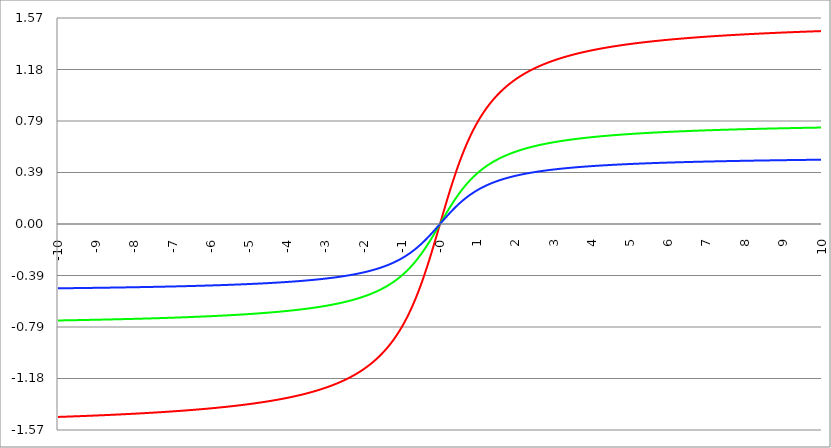
| Category | Series 1 | Series 0 | Series 2 |
|---|---|---|---|
| -10.0 | -1.471 | -0.736 | -0.49 |
| -9.99 | -1.471 | -0.736 | -0.49 |
| -9.98 | -1.471 | -0.735 | -0.49 |
| -9.97 | -1.471 | -0.735 | -0.49 |
| -9.96 | -1.471 | -0.735 | -0.49 |
| -9.95 | -1.471 | -0.735 | -0.49 |
| -9.940000000000001 | -1.471 | -0.735 | -0.49 |
| -9.930000000000001 | -1.47 | -0.735 | -0.49 |
| -9.920000000000002 | -1.47 | -0.735 | -0.49 |
| -9.91 | -1.47 | -0.735 | -0.49 |
| -9.900000000000002 | -1.47 | -0.735 | -0.49 |
| -9.890000000000002 | -1.47 | -0.735 | -0.49 |
| -9.880000000000003 | -1.47 | -0.735 | -0.49 |
| -9.870000000000003 | -1.47 | -0.735 | -0.49 |
| -9.860000000000001 | -1.47 | -0.735 | -0.49 |
| -9.850000000000003 | -1.47 | -0.735 | -0.49 |
| -9.840000000000003 | -1.47 | -0.735 | -0.49 |
| -9.830000000000004 | -1.469 | -0.735 | -0.49 |
| -9.820000000000004 | -1.469 | -0.735 | -0.49 |
| -9.810000000000004 | -1.469 | -0.735 | -0.49 |
| -9.800000000000004 | -1.469 | -0.735 | -0.49 |
| -9.790000000000004 | -1.469 | -0.735 | -0.49 |
| -9.780000000000005 | -1.469 | -0.734 | -0.49 |
| -9.770000000000005 | -1.469 | -0.734 | -0.49 |
| -9.760000000000005 | -1.469 | -0.734 | -0.49 |
| -9.750000000000005 | -1.469 | -0.734 | -0.49 |
| -9.740000000000006 | -1.468 | -0.734 | -0.489 |
| -9.730000000000006 | -1.468 | -0.734 | -0.489 |
| -9.720000000000006 | -1.468 | -0.734 | -0.489 |
| -9.710000000000006 | -1.468 | -0.734 | -0.489 |
| -9.700000000000006 | -1.468 | -0.734 | -0.489 |
| -9.690000000000007 | -1.468 | -0.734 | -0.489 |
| -9.680000000000007 | -1.468 | -0.734 | -0.489 |
| -9.670000000000007 | -1.468 | -0.734 | -0.489 |
| -9.660000000000007 | -1.468 | -0.734 | -0.489 |
| -9.650000000000007 | -1.468 | -0.734 | -0.489 |
| -9.640000000000008 | -1.467 | -0.734 | -0.489 |
| -9.630000000000008 | -1.467 | -0.734 | -0.489 |
| -9.620000000000008 | -1.467 | -0.734 | -0.489 |
| -9.610000000000008 | -1.467 | -0.734 | -0.489 |
| -9.600000000000009 | -1.467 | -0.734 | -0.489 |
| -9.590000000000009 | -1.467 | -0.733 | -0.489 |
| -9.580000000000007 | -1.467 | -0.733 | -0.489 |
| -9.57000000000001 | -1.467 | -0.733 | -0.489 |
| -9.56000000000001 | -1.467 | -0.733 | -0.489 |
| -9.55000000000001 | -1.466 | -0.733 | -0.489 |
| -9.54000000000001 | -1.466 | -0.733 | -0.489 |
| -9.53000000000001 | -1.466 | -0.733 | -0.489 |
| -9.52000000000001 | -1.466 | -0.733 | -0.489 |
| -9.51000000000001 | -1.466 | -0.733 | -0.489 |
| -9.50000000000001 | -1.466 | -0.733 | -0.489 |
| -9.49000000000001 | -1.466 | -0.733 | -0.489 |
| -9.48000000000001 | -1.466 | -0.733 | -0.489 |
| -9.47000000000001 | -1.466 | -0.733 | -0.489 |
| -9.46000000000001 | -1.465 | -0.733 | -0.488 |
| -9.45000000000001 | -1.465 | -0.733 | -0.488 |
| -9.44000000000001 | -1.465 | -0.733 | -0.488 |
| -9.430000000000012 | -1.465 | -0.733 | -0.488 |
| -9.420000000000012 | -1.465 | -0.733 | -0.488 |
| -9.410000000000013 | -1.465 | -0.732 | -0.488 |
| -9.400000000000013 | -1.465 | -0.732 | -0.488 |
| -9.390000000000011 | -1.465 | -0.732 | -0.488 |
| -9.380000000000013 | -1.465 | -0.732 | -0.488 |
| -9.370000000000013 | -1.464 | -0.732 | -0.488 |
| -9.360000000000014 | -1.464 | -0.732 | -0.488 |
| -9.350000000000014 | -1.464 | -0.732 | -0.488 |
| -9.340000000000014 | -1.464 | -0.732 | -0.488 |
| -9.330000000000014 | -1.464 | -0.732 | -0.488 |
| -9.320000000000014 | -1.464 | -0.732 | -0.488 |
| -9.310000000000015 | -1.464 | -0.732 | -0.488 |
| -9.300000000000013 | -1.464 | -0.732 | -0.488 |
| -9.290000000000015 | -1.464 | -0.732 | -0.488 |
| -9.280000000000015 | -1.463 | -0.732 | -0.488 |
| -9.270000000000016 | -1.463 | -0.732 | -0.488 |
| -9.260000000000016 | -1.463 | -0.732 | -0.488 |
| -9.250000000000014 | -1.463 | -0.732 | -0.488 |
| -9.240000000000016 | -1.463 | -0.731 | -0.488 |
| -9.230000000000016 | -1.463 | -0.731 | -0.488 |
| -9.220000000000017 | -1.463 | -0.731 | -0.488 |
| -9.210000000000017 | -1.463 | -0.731 | -0.488 |
| -9.200000000000017 | -1.463 | -0.731 | -0.488 |
| -9.190000000000017 | -1.462 | -0.731 | -0.487 |
| -9.180000000000017 | -1.462 | -0.731 | -0.487 |
| -9.170000000000018 | -1.462 | -0.731 | -0.487 |
| -9.160000000000016 | -1.462 | -0.731 | -0.487 |
| -9.150000000000018 | -1.462 | -0.731 | -0.487 |
| -9.140000000000018 | -1.462 | -0.731 | -0.487 |
| -9.130000000000019 | -1.462 | -0.731 | -0.487 |
| -9.120000000000019 | -1.462 | -0.731 | -0.487 |
| -9.110000000000017 | -1.461 | -0.731 | -0.487 |
| -9.10000000000002 | -1.461 | -0.731 | -0.487 |
| -9.09000000000002 | -1.461 | -0.731 | -0.487 |
| -9.08000000000002 | -1.461 | -0.731 | -0.487 |
| -9.07000000000002 | -1.461 | -0.73 | -0.487 |
| -9.06000000000002 | -1.461 | -0.73 | -0.487 |
| -9.05000000000002 | -1.461 | -0.73 | -0.487 |
| -9.04000000000002 | -1.461 | -0.73 | -0.487 |
| -9.03000000000002 | -1.461 | -0.73 | -0.487 |
| -9.020000000000021 | -1.46 | -0.73 | -0.487 |
| -9.010000000000021 | -1.46 | -0.73 | -0.487 |
| -9.000000000000021 | -1.46 | -0.73 | -0.487 |
| -8.990000000000022 | -1.46 | -0.73 | -0.487 |
| -8.980000000000022 | -1.46 | -0.73 | -0.487 |
| -8.97000000000002 | -1.46 | -0.73 | -0.487 |
| -8.960000000000022 | -1.46 | -0.73 | -0.487 |
| -8.950000000000022 | -1.46 | -0.73 | -0.487 |
| -8.940000000000023 | -1.459 | -0.73 | -0.486 |
| -8.930000000000023 | -1.459 | -0.73 | -0.486 |
| -8.920000000000023 | -1.459 | -0.73 | -0.486 |
| -8.910000000000023 | -1.459 | -0.73 | -0.486 |
| -8.900000000000023 | -1.459 | -0.729 | -0.486 |
| -8.890000000000024 | -1.459 | -0.729 | -0.486 |
| -8.880000000000024 | -1.459 | -0.729 | -0.486 |
| -8.870000000000024 | -1.459 | -0.729 | -0.486 |
| -8.860000000000024 | -1.458 | -0.729 | -0.486 |
| -8.850000000000025 | -1.458 | -0.729 | -0.486 |
| -8.840000000000025 | -1.458 | -0.729 | -0.486 |
| -8.830000000000025 | -1.458 | -0.729 | -0.486 |
| -8.820000000000025 | -1.458 | -0.729 | -0.486 |
| -8.810000000000025 | -1.458 | -0.729 | -0.486 |
| -8.800000000000026 | -1.458 | -0.729 | -0.486 |
| -8.790000000000026 | -1.458 | -0.729 | -0.486 |
| -8.780000000000026 | -1.457 | -0.729 | -0.486 |
| -8.770000000000026 | -1.457 | -0.729 | -0.486 |
| -8.760000000000026 | -1.457 | -0.729 | -0.486 |
| -8.750000000000027 | -1.457 | -0.729 | -0.486 |
| -8.740000000000027 | -1.457 | -0.728 | -0.486 |
| -8.730000000000027 | -1.457 | -0.728 | -0.486 |
| -8.720000000000027 | -1.457 | -0.728 | -0.486 |
| -8.710000000000027 | -1.456 | -0.728 | -0.485 |
| -8.700000000000028 | -1.456 | -0.728 | -0.485 |
| -8.690000000000028 | -1.456 | -0.728 | -0.485 |
| -8.680000000000028 | -1.456 | -0.728 | -0.485 |
| -8.670000000000028 | -1.456 | -0.728 | -0.485 |
| -8.660000000000029 | -1.456 | -0.728 | -0.485 |
| -8.650000000000029 | -1.456 | -0.728 | -0.485 |
| -8.640000000000029 | -1.456 | -0.728 | -0.485 |
| -8.63000000000003 | -1.455 | -0.728 | -0.485 |
| -8.62000000000003 | -1.455 | -0.728 | -0.485 |
| -8.61000000000003 | -1.455 | -0.728 | -0.485 |
| -8.60000000000003 | -1.455 | -0.728 | -0.485 |
| -8.59000000000003 | -1.455 | -0.727 | -0.485 |
| -8.58000000000003 | -1.455 | -0.727 | -0.485 |
| -8.57000000000003 | -1.455 | -0.727 | -0.485 |
| -8.56000000000003 | -1.455 | -0.727 | -0.485 |
| -8.55000000000003 | -1.454 | -0.727 | -0.485 |
| -8.540000000000031 | -1.454 | -0.727 | -0.485 |
| -8.530000000000031 | -1.454 | -0.727 | -0.485 |
| -8.520000000000032 | -1.454 | -0.727 | -0.485 |
| -8.510000000000032 | -1.454 | -0.727 | -0.485 |
| -8.50000000000003 | -1.454 | -0.727 | -0.485 |
| -8.490000000000032 | -1.454 | -0.727 | -0.485 |
| -8.480000000000032 | -1.453 | -0.727 | -0.484 |
| -8.470000000000033 | -1.453 | -0.727 | -0.484 |
| -8.460000000000033 | -1.453 | -0.727 | -0.484 |
| -8.450000000000033 | -1.453 | -0.727 | -0.484 |
| -8.440000000000033 | -1.453 | -0.726 | -0.484 |
| -8.430000000000033 | -1.453 | -0.726 | -0.484 |
| -8.420000000000034 | -1.453 | -0.726 | -0.484 |
| -8.410000000000032 | -1.452 | -0.726 | -0.484 |
| -8.400000000000034 | -1.452 | -0.726 | -0.484 |
| -8.390000000000034 | -1.452 | -0.726 | -0.484 |
| -8.380000000000035 | -1.452 | -0.726 | -0.484 |
| -8.370000000000035 | -1.452 | -0.726 | -0.484 |
| -8.360000000000033 | -1.452 | -0.726 | -0.484 |
| -8.350000000000035 | -1.452 | -0.726 | -0.484 |
| -8.340000000000035 | -1.451 | -0.726 | -0.484 |
| -8.330000000000036 | -1.451 | -0.726 | -0.484 |
| -8.320000000000036 | -1.451 | -0.726 | -0.484 |
| -8.310000000000034 | -1.451 | -0.726 | -0.484 |
| -8.300000000000036 | -1.451 | -0.725 | -0.484 |
| -8.290000000000036 | -1.451 | -0.725 | -0.484 |
| -8.280000000000037 | -1.451 | -0.725 | -0.484 |
| -8.270000000000037 | -1.45 | -0.725 | -0.483 |
| -8.260000000000037 | -1.45 | -0.725 | -0.483 |
| -8.250000000000037 | -1.45 | -0.725 | -0.483 |
| -8.240000000000038 | -1.45 | -0.725 | -0.483 |
| -8.230000000000038 | -1.45 | -0.725 | -0.483 |
| -8.220000000000038 | -1.45 | -0.725 | -0.483 |
| -8.210000000000038 | -1.45 | -0.725 | -0.483 |
| -8.200000000000038 | -1.449 | -0.725 | -0.483 |
| -8.190000000000039 | -1.449 | -0.725 | -0.483 |
| -8.180000000000039 | -1.449 | -0.725 | -0.483 |
| -8.170000000000037 | -1.449 | -0.725 | -0.483 |
| -8.16000000000004 | -1.449 | -0.724 | -0.483 |
| -8.15000000000004 | -1.449 | -0.724 | -0.483 |
| -8.14000000000004 | -1.449 | -0.724 | -0.483 |
| -8.13000000000004 | -1.448 | -0.724 | -0.483 |
| -8.12000000000004 | -1.448 | -0.724 | -0.483 |
| -8.11000000000004 | -1.448 | -0.724 | -0.483 |
| -8.10000000000004 | -1.448 | -0.724 | -0.483 |
| -8.09000000000004 | -1.448 | -0.724 | -0.483 |
| -8.08000000000004 | -1.448 | -0.724 | -0.483 |
| -8.07000000000004 | -1.448 | -0.724 | -0.483 |
| -8.06000000000004 | -1.447 | -0.724 | -0.482 |
| -8.05000000000004 | -1.447 | -0.724 | -0.482 |
| -8.040000000000042 | -1.447 | -0.724 | -0.482 |
| -8.03000000000004 | -1.447 | -0.723 | -0.482 |
| -8.020000000000042 | -1.447 | -0.723 | -0.482 |
| -8.010000000000042 | -1.447 | -0.723 | -0.482 |
| -8.000000000000043 | -1.446 | -0.723 | -0.482 |
| -7.990000000000043 | -1.446 | -0.723 | -0.482 |
| -7.980000000000043 | -1.446 | -0.723 | -0.482 |
| -7.970000000000043 | -1.446 | -0.723 | -0.482 |
| -7.960000000000043 | -1.446 | -0.723 | -0.482 |
| -7.950000000000044 | -1.446 | -0.723 | -0.482 |
| -7.940000000000044 | -1.446 | -0.723 | -0.482 |
| -7.930000000000044 | -1.445 | -0.723 | -0.482 |
| -7.920000000000044 | -1.445 | -0.723 | -0.482 |
| -7.910000000000044 | -1.445 | -0.723 | -0.482 |
| -7.900000000000044 | -1.445 | -0.722 | -0.482 |
| -7.890000000000045 | -1.445 | -0.722 | -0.482 |
| -7.880000000000045 | -1.445 | -0.722 | -0.482 |
| -7.870000000000045 | -1.444 | -0.722 | -0.481 |
| -7.860000000000046 | -1.444 | -0.722 | -0.481 |
| -7.850000000000046 | -1.444 | -0.722 | -0.481 |
| -7.840000000000046 | -1.444 | -0.722 | -0.481 |
| -7.830000000000046 | -1.444 | -0.722 | -0.481 |
| -7.820000000000046 | -1.444 | -0.722 | -0.481 |
| -7.810000000000047 | -1.443 | -0.722 | -0.481 |
| -7.800000000000047 | -1.443 | -0.722 | -0.481 |
| -7.790000000000047 | -1.443 | -0.722 | -0.481 |
| -7.780000000000047 | -1.443 | -0.721 | -0.481 |
| -7.770000000000047 | -1.443 | -0.721 | -0.481 |
| -7.760000000000048 | -1.443 | -0.721 | -0.481 |
| -7.750000000000048 | -1.442 | -0.721 | -0.481 |
| -7.740000000000048 | -1.442 | -0.721 | -0.481 |
| -7.730000000000048 | -1.442 | -0.721 | -0.481 |
| -7.720000000000049 | -1.442 | -0.721 | -0.481 |
| -7.710000000000049 | -1.442 | -0.721 | -0.481 |
| -7.700000000000049 | -1.442 | -0.721 | -0.481 |
| -7.690000000000049 | -1.441 | -0.721 | -0.48 |
| -7.680000000000049 | -1.441 | -0.721 | -0.48 |
| -7.67000000000005 | -1.441 | -0.721 | -0.48 |
| -7.66000000000005 | -1.441 | -0.72 | -0.48 |
| -7.65000000000005 | -1.441 | -0.72 | -0.48 |
| -7.64000000000005 | -1.441 | -0.72 | -0.48 |
| -7.63000000000005 | -1.44 | -0.72 | -0.48 |
| -7.620000000000051 | -1.44 | -0.72 | -0.48 |
| -7.610000000000051 | -1.44 | -0.72 | -0.48 |
| -7.600000000000051 | -1.44 | -0.72 | -0.48 |
| -7.590000000000051 | -1.44 | -0.72 | -0.48 |
| -7.580000000000052 | -1.44 | -0.72 | -0.48 |
| -7.570000000000052 | -1.439 | -0.72 | -0.48 |
| -7.560000000000052 | -1.439 | -0.72 | -0.48 |
| -7.550000000000052 | -1.439 | -0.72 | -0.48 |
| -7.540000000000052 | -1.439 | -0.719 | -0.48 |
| -7.530000000000053 | -1.439 | -0.719 | -0.48 |
| -7.520000000000053 | -1.439 | -0.719 | -0.48 |
| -7.510000000000053 | -1.438 | -0.719 | -0.479 |
| -7.500000000000053 | -1.438 | -0.719 | -0.479 |
| -7.490000000000053 | -1.438 | -0.719 | -0.479 |
| -7.480000000000054 | -1.438 | -0.719 | -0.479 |
| -7.470000000000054 | -1.438 | -0.719 | -0.479 |
| -7.460000000000054 | -1.438 | -0.719 | -0.479 |
| -7.450000000000054 | -1.437 | -0.719 | -0.479 |
| -7.440000000000054 | -1.437 | -0.719 | -0.479 |
| -7.430000000000054 | -1.437 | -0.719 | -0.479 |
| -7.420000000000055 | -1.437 | -0.718 | -0.479 |
| -7.410000000000055 | -1.437 | -0.718 | -0.479 |
| -7.400000000000055 | -1.436 | -0.718 | -0.479 |
| -7.390000000000056 | -1.436 | -0.718 | -0.479 |
| -7.380000000000056 | -1.436 | -0.718 | -0.479 |
| -7.370000000000056 | -1.436 | -0.718 | -0.479 |
| -7.360000000000056 | -1.436 | -0.718 | -0.479 |
| -7.350000000000056 | -1.436 | -0.718 | -0.479 |
| -7.340000000000057 | -1.435 | -0.718 | -0.478 |
| -7.330000000000057 | -1.435 | -0.718 | -0.478 |
| -7.320000000000057 | -1.435 | -0.718 | -0.478 |
| -7.310000000000057 | -1.435 | -0.717 | -0.478 |
| -7.300000000000058 | -1.435 | -0.717 | -0.478 |
| -7.290000000000058 | -1.434 | -0.717 | -0.478 |
| -7.280000000000058 | -1.434 | -0.717 | -0.478 |
| -7.270000000000058 | -1.434 | -0.717 | -0.478 |
| -7.260000000000058 | -1.434 | -0.717 | -0.478 |
| -7.250000000000059 | -1.434 | -0.717 | -0.478 |
| -7.240000000000059 | -1.434 | -0.717 | -0.478 |
| -7.23000000000006 | -1.433 | -0.717 | -0.478 |
| -7.220000000000059 | -1.433 | -0.717 | -0.478 |
| -7.210000000000059 | -1.433 | -0.716 | -0.478 |
| -7.20000000000006 | -1.433 | -0.716 | -0.478 |
| -7.19000000000006 | -1.433 | -0.716 | -0.478 |
| -7.18000000000006 | -1.432 | -0.716 | -0.477 |
| -7.17000000000006 | -1.432 | -0.716 | -0.477 |
| -7.160000000000061 | -1.432 | -0.716 | -0.477 |
| -7.150000000000061 | -1.432 | -0.716 | -0.477 |
| -7.140000000000061 | -1.432 | -0.716 | -0.477 |
| -7.130000000000061 | -1.431 | -0.716 | -0.477 |
| -7.120000000000061 | -1.431 | -0.716 | -0.477 |
| -7.110000000000062 | -1.431 | -0.716 | -0.477 |
| -7.100000000000062 | -1.431 | -0.715 | -0.477 |
| -7.090000000000062 | -1.431 | -0.715 | -0.477 |
| -7.080000000000062 | -1.43 | -0.715 | -0.477 |
| -7.070000000000062 | -1.43 | -0.715 | -0.477 |
| -7.060000000000063 | -1.43 | -0.715 | -0.477 |
| -7.050000000000063 | -1.43 | -0.715 | -0.477 |
| -7.040000000000063 | -1.43 | -0.715 | -0.477 |
| -7.030000000000063 | -1.429 | -0.715 | -0.476 |
| -7.020000000000064 | -1.429 | -0.715 | -0.476 |
| -7.010000000000064 | -1.429 | -0.715 | -0.476 |
| -7.000000000000064 | -1.429 | -0.714 | -0.476 |
| -6.990000000000064 | -1.429 | -0.714 | -0.476 |
| -6.980000000000064 | -1.428 | -0.714 | -0.476 |
| -6.970000000000064 | -1.428 | -0.714 | -0.476 |
| -6.960000000000064 | -1.428 | -0.714 | -0.476 |
| -6.950000000000064 | -1.428 | -0.714 | -0.476 |
| -6.940000000000065 | -1.428 | -0.714 | -0.476 |
| -6.930000000000065 | -1.427 | -0.714 | -0.476 |
| -6.920000000000065 | -1.427 | -0.714 | -0.476 |
| -6.910000000000065 | -1.427 | -0.714 | -0.476 |
| -6.900000000000066 | -1.427 | -0.713 | -0.476 |
| -6.890000000000066 | -1.427 | -0.713 | -0.476 |
| -6.880000000000066 | -1.426 | -0.713 | -0.475 |
| -6.870000000000066 | -1.426 | -0.713 | -0.475 |
| -6.860000000000067 | -1.426 | -0.713 | -0.475 |
| -6.850000000000067 | -1.426 | -0.713 | -0.475 |
| -6.840000000000067 | -1.426 | -0.713 | -0.475 |
| -6.830000000000067 | -1.425 | -0.713 | -0.475 |
| -6.820000000000068 | -1.425 | -0.713 | -0.475 |
| -6.810000000000068 | -1.425 | -0.712 | -0.475 |
| -6.800000000000068 | -1.425 | -0.712 | -0.475 |
| -6.790000000000068 | -1.425 | -0.712 | -0.475 |
| -6.780000000000068 | -1.424 | -0.712 | -0.475 |
| -6.770000000000068 | -1.424 | -0.712 | -0.475 |
| -6.760000000000069 | -1.424 | -0.712 | -0.475 |
| -6.75000000000007 | -1.424 | -0.712 | -0.475 |
| -6.74000000000007 | -1.424 | -0.712 | -0.475 |
| -6.73000000000007 | -1.423 | -0.712 | -0.474 |
| -6.72000000000007 | -1.423 | -0.712 | -0.474 |
| -6.71000000000007 | -1.423 | -0.711 | -0.474 |
| -6.70000000000007 | -1.423 | -0.711 | -0.474 |
| -6.69000000000007 | -1.422 | -0.711 | -0.474 |
| -6.680000000000071 | -1.422 | -0.711 | -0.474 |
| -6.670000000000071 | -1.422 | -0.711 | -0.474 |
| -6.660000000000071 | -1.422 | -0.711 | -0.474 |
| -6.650000000000071 | -1.422 | -0.711 | -0.474 |
| -6.640000000000072 | -1.421 | -0.711 | -0.474 |
| -6.630000000000072 | -1.421 | -0.711 | -0.474 |
| -6.620000000000072 | -1.421 | -0.71 | -0.474 |
| -6.610000000000072 | -1.421 | -0.71 | -0.474 |
| -6.600000000000072 | -1.42 | -0.71 | -0.473 |
| -6.590000000000073 | -1.42 | -0.71 | -0.473 |
| -6.580000000000073 | -1.42 | -0.71 | -0.473 |
| -6.570000000000073 | -1.42 | -0.71 | -0.473 |
| -6.560000000000073 | -1.42 | -0.71 | -0.473 |
| -6.550000000000074 | -1.419 | -0.71 | -0.473 |
| -6.540000000000074 | -1.419 | -0.71 | -0.473 |
| -6.530000000000074 | -1.419 | -0.709 | -0.473 |
| -6.520000000000074 | -1.419 | -0.709 | -0.473 |
| -6.510000000000074 | -1.418 | -0.709 | -0.473 |
| -6.500000000000074 | -1.418 | -0.709 | -0.473 |
| -6.490000000000074 | -1.418 | -0.709 | -0.473 |
| -6.480000000000074 | -1.418 | -0.709 | -0.473 |
| -6.470000000000075 | -1.417 | -0.709 | -0.472 |
| -6.460000000000075 | -1.417 | -0.709 | -0.472 |
| -6.450000000000075 | -1.417 | -0.708 | -0.472 |
| -6.440000000000075 | -1.417 | -0.708 | -0.472 |
| -6.430000000000076 | -1.417 | -0.708 | -0.472 |
| -6.420000000000076 | -1.416 | -0.708 | -0.472 |
| -6.410000000000076 | -1.416 | -0.708 | -0.472 |
| -6.400000000000076 | -1.416 | -0.708 | -0.472 |
| -6.390000000000077 | -1.416 | -0.708 | -0.472 |
| -6.380000000000077 | -1.415 | -0.708 | -0.472 |
| -6.370000000000077 | -1.415 | -0.708 | -0.472 |
| -6.360000000000078 | -1.415 | -0.707 | -0.472 |
| -6.350000000000078 | -1.415 | -0.707 | -0.472 |
| -6.340000000000078 | -1.414 | -0.707 | -0.471 |
| -6.330000000000078 | -1.414 | -0.707 | -0.471 |
| -6.320000000000078 | -1.414 | -0.707 | -0.471 |
| -6.310000000000079 | -1.414 | -0.707 | -0.471 |
| -6.300000000000079 | -1.413 | -0.707 | -0.471 |
| -6.29000000000008 | -1.413 | -0.707 | -0.471 |
| -6.28000000000008 | -1.413 | -0.706 | -0.471 |
| -6.27000000000008 | -1.413 | -0.706 | -0.471 |
| -6.26000000000008 | -1.412 | -0.706 | -0.471 |
| -6.25000000000008 | -1.412 | -0.706 | -0.471 |
| -6.24000000000008 | -1.412 | -0.706 | -0.471 |
| -6.23000000000008 | -1.412 | -0.706 | -0.471 |
| -6.220000000000081 | -1.411 | -0.706 | -0.47 |
| -6.210000000000081 | -1.411 | -0.706 | -0.47 |
| -6.200000000000081 | -1.411 | -0.705 | -0.47 |
| -6.190000000000081 | -1.411 | -0.705 | -0.47 |
| -6.180000000000081 | -1.41 | -0.705 | -0.47 |
| -6.170000000000082 | -1.41 | -0.705 | -0.47 |
| -6.160000000000082 | -1.41 | -0.705 | -0.47 |
| -6.150000000000082 | -1.41 | -0.705 | -0.47 |
| -6.140000000000082 | -1.409 | -0.705 | -0.47 |
| -6.130000000000082 | -1.409 | -0.705 | -0.47 |
| -6.120000000000083 | -1.409 | -0.704 | -0.47 |
| -6.110000000000083 | -1.409 | -0.704 | -0.47 |
| -6.100000000000083 | -1.408 | -0.704 | -0.469 |
| -6.090000000000083 | -1.408 | -0.704 | -0.469 |
| -6.080000000000084 | -1.408 | -0.704 | -0.469 |
| -6.070000000000084 | -1.408 | -0.704 | -0.469 |
| -6.060000000000084 | -1.407 | -0.704 | -0.469 |
| -6.050000000000084 | -1.407 | -0.703 | -0.469 |
| -6.040000000000084 | -1.407 | -0.703 | -0.469 |
| -6.030000000000084 | -1.406 | -0.703 | -0.469 |
| -6.020000000000085 | -1.406 | -0.703 | -0.469 |
| -6.010000000000085 | -1.406 | -0.703 | -0.469 |
| -6.000000000000085 | -1.406 | -0.703 | -0.469 |
| -5.990000000000085 | -1.405 | -0.703 | -0.468 |
| -5.980000000000085 | -1.405 | -0.703 | -0.468 |
| -5.970000000000085 | -1.405 | -0.702 | -0.468 |
| -5.960000000000086 | -1.405 | -0.702 | -0.468 |
| -5.950000000000086 | -1.404 | -0.702 | -0.468 |
| -5.940000000000086 | -1.404 | -0.702 | -0.468 |
| -5.930000000000086 | -1.404 | -0.702 | -0.468 |
| -5.920000000000087 | -1.403 | -0.702 | -0.468 |
| -5.910000000000087 | -1.403 | -0.702 | -0.468 |
| -5.900000000000087 | -1.403 | -0.701 | -0.468 |
| -5.890000000000088 | -1.403 | -0.701 | -0.468 |
| -5.880000000000088 | -1.402 | -0.701 | -0.467 |
| -5.870000000000088 | -1.402 | -0.701 | -0.467 |
| -5.860000000000088 | -1.402 | -0.701 | -0.467 |
| -5.850000000000088 | -1.401 | -0.701 | -0.467 |
| -5.840000000000089 | -1.401 | -0.701 | -0.467 |
| -5.830000000000089 | -1.401 | -0.7 | -0.467 |
| -5.820000000000089 | -1.401 | -0.7 | -0.467 |
| -5.810000000000089 | -1.4 | -0.7 | -0.467 |
| -5.800000000000089 | -1.4 | -0.7 | -0.467 |
| -5.79000000000009 | -1.4 | -0.7 | -0.467 |
| -5.78000000000009 | -1.399 | -0.7 | -0.466 |
| -5.77000000000009 | -1.399 | -0.7 | -0.466 |
| -5.76000000000009 | -1.399 | -0.699 | -0.466 |
| -5.750000000000091 | -1.399 | -0.699 | -0.466 |
| -5.740000000000091 | -1.398 | -0.699 | -0.466 |
| -5.730000000000091 | -1.398 | -0.699 | -0.466 |
| -5.720000000000091 | -1.398 | -0.699 | -0.466 |
| -5.710000000000091 | -1.397 | -0.699 | -0.466 |
| -5.700000000000092 | -1.397 | -0.699 | -0.466 |
| -5.690000000000092 | -1.397 | -0.698 | -0.466 |
| -5.680000000000092 | -1.397 | -0.698 | -0.466 |
| -5.670000000000092 | -1.396 | -0.698 | -0.465 |
| -5.660000000000092 | -1.396 | -0.698 | -0.465 |
| -5.650000000000093 | -1.396 | -0.698 | -0.465 |
| -5.640000000000093 | -1.395 | -0.698 | -0.465 |
| -5.630000000000093 | -1.395 | -0.698 | -0.465 |
| -5.620000000000093 | -1.395 | -0.697 | -0.465 |
| -5.610000000000093 | -1.394 | -0.697 | -0.465 |
| -5.600000000000094 | -1.394 | -0.697 | -0.465 |
| -5.590000000000094 | -1.394 | -0.697 | -0.465 |
| -5.580000000000094 | -1.393 | -0.697 | -0.464 |
| -5.570000000000094 | -1.393 | -0.697 | -0.464 |
| -5.560000000000095 | -1.393 | -0.696 | -0.464 |
| -5.550000000000095 | -1.393 | -0.696 | -0.464 |
| -5.540000000000095 | -1.392 | -0.696 | -0.464 |
| -5.530000000000095 | -1.392 | -0.696 | -0.464 |
| -5.520000000000095 | -1.392 | -0.696 | -0.464 |
| -5.510000000000096 | -1.391 | -0.696 | -0.464 |
| -5.500000000000096 | -1.391 | -0.695 | -0.464 |
| -5.490000000000096 | -1.391 | -0.695 | -0.464 |
| -5.480000000000096 | -1.39 | -0.695 | -0.463 |
| -5.470000000000096 | -1.39 | -0.695 | -0.463 |
| -5.460000000000097 | -1.39 | -0.695 | -0.463 |
| -5.450000000000097 | -1.389 | -0.695 | -0.463 |
| -5.440000000000097 | -1.389 | -0.695 | -0.463 |
| -5.430000000000097 | -1.389 | -0.694 | -0.463 |
| -5.420000000000098 | -1.388 | -0.694 | -0.463 |
| -5.410000000000098 | -1.388 | -0.694 | -0.463 |
| -5.400000000000098 | -1.388 | -0.694 | -0.463 |
| -5.390000000000098 | -1.387 | -0.694 | -0.462 |
| -5.380000000000098 | -1.387 | -0.694 | -0.462 |
| -5.370000000000099 | -1.387 | -0.693 | -0.462 |
| -5.360000000000099 | -1.386 | -0.693 | -0.462 |
| -5.350000000000099 | -1.386 | -0.693 | -0.462 |
| -5.340000000000099 | -1.386 | -0.693 | -0.462 |
| -5.330000000000099 | -1.385 | -0.693 | -0.462 |
| -5.3200000000001 | -1.385 | -0.692 | -0.462 |
| -5.3100000000001 | -1.385 | -0.692 | -0.462 |
| -5.3000000000001 | -1.384 | -0.692 | -0.461 |
| -5.2900000000001 | -1.384 | -0.692 | -0.461 |
| -5.2800000000001 | -1.384 | -0.692 | -0.461 |
| -5.2700000000001 | -1.383 | -0.692 | -0.461 |
| -5.260000000000101 | -1.383 | -0.691 | -0.461 |
| -5.250000000000101 | -1.383 | -0.691 | -0.461 |
| -5.240000000000101 | -1.382 | -0.691 | -0.461 |
| -5.230000000000101 | -1.382 | -0.691 | -0.461 |
| -5.220000000000102 | -1.382 | -0.691 | -0.461 |
| -5.210000000000102 | -1.381 | -0.691 | -0.46 |
| -5.200000000000102 | -1.381 | -0.69 | -0.46 |
| -5.190000000000103 | -1.38 | -0.69 | -0.46 |
| -5.180000000000103 | -1.38 | -0.69 | -0.46 |
| -5.170000000000103 | -1.38 | -0.69 | -0.46 |
| -5.160000000000103 | -1.379 | -0.69 | -0.46 |
| -5.150000000000103 | -1.379 | -0.69 | -0.46 |
| -5.140000000000104 | -1.379 | -0.689 | -0.46 |
| -5.130000000000104 | -1.378 | -0.689 | -0.459 |
| -5.120000000000104 | -1.378 | -0.689 | -0.459 |
| -5.110000000000104 | -1.378 | -0.689 | -0.459 |
| -5.100000000000104 | -1.377 | -0.689 | -0.459 |
| -5.090000000000104 | -1.377 | -0.688 | -0.459 |
| -5.080000000000104 | -1.376 | -0.688 | -0.459 |
| -5.070000000000105 | -1.376 | -0.688 | -0.459 |
| -5.060000000000105 | -1.376 | -0.688 | -0.459 |
| -5.050000000000105 | -1.375 | -0.688 | -0.458 |
| -5.040000000000105 | -1.375 | -0.687 | -0.458 |
| -5.030000000000105 | -1.375 | -0.687 | -0.458 |
| -5.020000000000106 | -1.374 | -0.687 | -0.458 |
| -5.010000000000106 | -1.374 | -0.687 | -0.458 |
| -5.000000000000106 | -1.373 | -0.687 | -0.458 |
| -4.990000000000106 | -1.373 | -0.687 | -0.458 |
| -4.980000000000106 | -1.373 | -0.686 | -0.458 |
| -4.970000000000107 | -1.372 | -0.686 | -0.457 |
| -4.960000000000107 | -1.372 | -0.686 | -0.457 |
| -4.950000000000107 | -1.371 | -0.686 | -0.457 |
| -4.940000000000107 | -1.371 | -0.686 | -0.457 |
| -4.930000000000108 | -1.371 | -0.685 | -0.457 |
| -4.920000000000108 | -1.37 | -0.685 | -0.457 |
| -4.910000000000108 | -1.37 | -0.685 | -0.457 |
| -4.900000000000108 | -1.369 | -0.685 | -0.456 |
| -4.890000000000109 | -1.369 | -0.685 | -0.456 |
| -4.88000000000011 | -1.369 | -0.684 | -0.456 |
| -4.87000000000011 | -1.368 | -0.684 | -0.456 |
| -4.86000000000011 | -1.368 | -0.684 | -0.456 |
| -4.85000000000011 | -1.367 | -0.684 | -0.456 |
| -4.84000000000011 | -1.367 | -0.684 | -0.456 |
| -4.83000000000011 | -1.367 | -0.683 | -0.456 |
| -4.82000000000011 | -1.366 | -0.683 | -0.455 |
| -4.810000000000111 | -1.366 | -0.683 | -0.455 |
| -4.800000000000111 | -1.365 | -0.683 | -0.455 |
| -4.790000000000111 | -1.365 | -0.682 | -0.455 |
| -4.780000000000111 | -1.365 | -0.682 | -0.455 |
| -4.770000000000111 | -1.364 | -0.682 | -0.455 |
| -4.760000000000112 | -1.364 | -0.682 | -0.455 |
| -4.750000000000112 | -1.363 | -0.682 | -0.454 |
| -4.740000000000112 | -1.363 | -0.681 | -0.454 |
| -4.730000000000112 | -1.362 | -0.681 | -0.454 |
| -4.720000000000112 | -1.362 | -0.681 | -0.454 |
| -4.710000000000113 | -1.362 | -0.681 | -0.454 |
| -4.700000000000113 | -1.361 | -0.681 | -0.454 |
| -4.690000000000113 | -1.361 | -0.68 | -0.454 |
| -4.680000000000113 | -1.36 | -0.68 | -0.453 |
| -4.670000000000114 | -1.36 | -0.68 | -0.453 |
| -4.660000000000114 | -1.359 | -0.68 | -0.453 |
| -4.650000000000114 | -1.359 | -0.679 | -0.453 |
| -4.640000000000114 | -1.359 | -0.679 | -0.453 |
| -4.630000000000114 | -1.358 | -0.679 | -0.453 |
| -4.620000000000115 | -1.358 | -0.679 | -0.453 |
| -4.610000000000115 | -1.357 | -0.679 | -0.452 |
| -4.600000000000115 | -1.357 | -0.678 | -0.452 |
| -4.590000000000115 | -1.356 | -0.678 | -0.452 |
| -4.580000000000115 | -1.356 | -0.678 | -0.452 |
| -4.570000000000115 | -1.355 | -0.678 | -0.452 |
| -4.560000000000116 | -1.355 | -0.677 | -0.452 |
| -4.550000000000116 | -1.354 | -0.677 | -0.451 |
| -4.540000000000116 | -1.354 | -0.677 | -0.451 |
| -4.530000000000116 | -1.354 | -0.677 | -0.451 |
| -4.520000000000117 | -1.353 | -0.677 | -0.451 |
| -4.510000000000117 | -1.353 | -0.676 | -0.451 |
| -4.500000000000117 | -1.352 | -0.676 | -0.451 |
| -4.490000000000117 | -1.352 | -0.676 | -0.451 |
| -4.480000000000117 | -1.351 | -0.676 | -0.45 |
| -4.470000000000117 | -1.351 | -0.675 | -0.45 |
| -4.460000000000118 | -1.35 | -0.675 | -0.45 |
| -4.450000000000118 | -1.35 | -0.675 | -0.45 |
| -4.440000000000118 | -1.349 | -0.675 | -0.45 |
| -4.430000000000118 | -1.349 | -0.674 | -0.45 |
| -4.420000000000119 | -1.348 | -0.674 | -0.449 |
| -4.41000000000012 | -1.348 | -0.674 | -0.449 |
| -4.40000000000012 | -1.347 | -0.674 | -0.449 |
| -4.39000000000012 | -1.347 | -0.673 | -0.449 |
| -4.38000000000012 | -1.346 | -0.673 | -0.449 |
| -4.37000000000012 | -1.346 | -0.673 | -0.449 |
| -4.36000000000012 | -1.345 | -0.673 | -0.448 |
| -4.35000000000012 | -1.345 | -0.672 | -0.448 |
| -4.34000000000012 | -1.344 | -0.672 | -0.448 |
| -4.33000000000012 | -1.344 | -0.672 | -0.448 |
| -4.320000000000121 | -1.343 | -0.672 | -0.448 |
| -4.310000000000121 | -1.343 | -0.671 | -0.448 |
| -4.300000000000121 | -1.342 | -0.671 | -0.447 |
| -4.290000000000121 | -1.342 | -0.671 | -0.447 |
| -4.280000000000121 | -1.341 | -0.671 | -0.447 |
| -4.270000000000122 | -1.341 | -0.67 | -0.447 |
| -4.260000000000122 | -1.34 | -0.67 | -0.447 |
| -4.250000000000122 | -1.34 | -0.67 | -0.447 |
| -4.240000000000122 | -1.339 | -0.67 | -0.446 |
| -4.230000000000122 | -1.339 | -0.669 | -0.446 |
| -4.220000000000123 | -1.338 | -0.669 | -0.446 |
| -4.210000000000123 | -1.338 | -0.669 | -0.446 |
| -4.200000000000123 | -1.337 | -0.669 | -0.446 |
| -4.190000000000124 | -1.337 | -0.668 | -0.446 |
| -4.180000000000124 | -1.336 | -0.668 | -0.445 |
| -4.170000000000124 | -1.335 | -0.668 | -0.445 |
| -4.160000000000124 | -1.335 | -0.667 | -0.445 |
| -4.150000000000124 | -1.334 | -0.667 | -0.445 |
| -4.140000000000124 | -1.334 | -0.667 | -0.445 |
| -4.130000000000125 | -1.333 | -0.667 | -0.444 |
| -4.120000000000125 | -1.333 | -0.666 | -0.444 |
| -4.110000000000125 | -1.332 | -0.666 | -0.444 |
| -4.100000000000125 | -1.332 | -0.666 | -0.444 |
| -4.090000000000125 | -1.331 | -0.666 | -0.444 |
| -4.080000000000126 | -1.33 | -0.665 | -0.443 |
| -4.070000000000126 | -1.33 | -0.665 | -0.443 |
| -4.060000000000126 | -1.329 | -0.665 | -0.443 |
| -4.050000000000126 | -1.329 | -0.664 | -0.443 |
| -4.040000000000127 | -1.328 | -0.664 | -0.443 |
| -4.030000000000127 | -1.328 | -0.664 | -0.443 |
| -4.020000000000127 | -1.327 | -0.663 | -0.442 |
| -4.010000000000127 | -1.326 | -0.663 | -0.442 |
| -4.000000000000127 | -1.326 | -0.663 | -0.442 |
| -3.990000000000128 | -1.325 | -0.663 | -0.442 |
| -3.980000000000128 | -1.325 | -0.662 | -0.442 |
| -3.970000000000129 | -1.324 | -0.662 | -0.441 |
| -3.960000000000129 | -1.323 | -0.662 | -0.441 |
| -3.950000000000129 | -1.323 | -0.661 | -0.441 |
| -3.940000000000129 | -1.322 | -0.661 | -0.441 |
| -3.930000000000129 | -1.322 | -0.661 | -0.441 |
| -3.92000000000013 | -1.321 | -0.661 | -0.44 |
| -3.91000000000013 | -1.32 | -0.66 | -0.44 |
| -3.90000000000013 | -1.32 | -0.66 | -0.44 |
| -3.89000000000013 | -1.319 | -0.66 | -0.44 |
| -3.88000000000013 | -1.319 | -0.659 | -0.44 |
| -3.870000000000131 | -1.318 | -0.659 | -0.439 |
| -3.860000000000131 | -1.317 | -0.659 | -0.439 |
| -3.850000000000131 | -1.317 | -0.658 | -0.439 |
| -3.840000000000131 | -1.316 | -0.658 | -0.439 |
| -3.830000000000131 | -1.315 | -0.658 | -0.438 |
| -3.820000000000132 | -1.315 | -0.657 | -0.438 |
| -3.810000000000132 | -1.314 | -0.657 | -0.438 |
| -3.800000000000132 | -1.313 | -0.657 | -0.438 |
| -3.790000000000132 | -1.313 | -0.656 | -0.438 |
| -3.780000000000132 | -1.312 | -0.656 | -0.437 |
| -3.770000000000133 | -1.312 | -0.656 | -0.437 |
| -3.760000000000133 | -1.311 | -0.655 | -0.437 |
| -3.750000000000133 | -1.31 | -0.655 | -0.437 |
| -3.740000000000133 | -1.31 | -0.655 | -0.437 |
| -3.730000000000134 | -1.309 | -0.654 | -0.436 |
| -3.720000000000134 | -1.308 | -0.654 | -0.436 |
| -3.710000000000134 | -1.308 | -0.654 | -0.436 |
| -3.700000000000134 | -1.307 | -0.653 | -0.436 |
| -3.690000000000134 | -1.306 | -0.653 | -0.435 |
| -3.680000000000135 | -1.305 | -0.653 | -0.435 |
| -3.670000000000135 | -1.305 | -0.652 | -0.435 |
| -3.660000000000135 | -1.304 | -0.652 | -0.435 |
| -3.650000000000135 | -1.303 | -0.652 | -0.434 |
| -3.640000000000135 | -1.303 | -0.651 | -0.434 |
| -3.630000000000136 | -1.302 | -0.651 | -0.434 |
| -3.620000000000136 | -1.301 | -0.651 | -0.434 |
| -3.610000000000136 | -1.301 | -0.65 | -0.434 |
| -3.600000000000136 | -1.3 | -0.65 | -0.433 |
| -3.590000000000137 | -1.299 | -0.65 | -0.433 |
| -3.580000000000137 | -1.298 | -0.649 | -0.433 |
| -3.570000000000137 | -1.298 | -0.649 | -0.433 |
| -3.560000000000137 | -1.297 | -0.648 | -0.432 |
| -3.550000000000137 | -1.296 | -0.648 | -0.432 |
| -3.540000000000138 | -1.295 | -0.648 | -0.432 |
| -3.530000000000138 | -1.295 | -0.647 | -0.432 |
| -3.520000000000138 | -1.294 | -0.647 | -0.431 |
| -3.510000000000138 | -1.293 | -0.647 | -0.431 |
| -3.500000000000139 | -1.292 | -0.646 | -0.431 |
| -3.490000000000139 | -1.292 | -0.646 | -0.431 |
| -3.480000000000139 | -1.291 | -0.645 | -0.43 |
| -3.470000000000139 | -1.29 | -0.645 | -0.43 |
| -3.460000000000139 | -1.289 | -0.645 | -0.43 |
| -3.45000000000014 | -1.289 | -0.644 | -0.43 |
| -3.44000000000014 | -1.288 | -0.644 | -0.429 |
| -3.43000000000014 | -1.287 | -0.644 | -0.429 |
| -3.42000000000014 | -1.286 | -0.643 | -0.429 |
| -3.41000000000014 | -1.286 | -0.643 | -0.429 |
| -3.400000000000141 | -1.285 | -0.642 | -0.428 |
| -3.390000000000141 | -1.284 | -0.642 | -0.428 |
| -3.380000000000141 | -1.283 | -0.642 | -0.428 |
| -3.370000000000141 | -1.282 | -0.641 | -0.427 |
| -3.360000000000141 | -1.282 | -0.641 | -0.427 |
| -3.350000000000142 | -1.281 | -0.64 | -0.427 |
| -3.340000000000142 | -1.28 | -0.64 | -0.427 |
| -3.330000000000142 | -1.279 | -0.64 | -0.426 |
| -3.320000000000142 | -1.278 | -0.639 | -0.426 |
| -3.310000000000143 | -1.277 | -0.639 | -0.426 |
| -3.300000000000143 | -1.277 | -0.638 | -0.426 |
| -3.290000000000143 | -1.276 | -0.638 | -0.425 |
| -3.280000000000143 | -1.275 | -0.637 | -0.425 |
| -3.270000000000143 | -1.274 | -0.637 | -0.425 |
| -3.260000000000144 | -1.273 | -0.637 | -0.424 |
| -3.250000000000144 | -1.272 | -0.636 | -0.424 |
| -3.240000000000144 | -1.271 | -0.636 | -0.424 |
| -3.230000000000144 | -1.271 | -0.635 | -0.424 |
| -3.220000000000145 | -1.27 | -0.635 | -0.423 |
| -3.210000000000145 | -1.269 | -0.634 | -0.423 |
| -3.200000000000145 | -1.268 | -0.634 | -0.423 |
| -3.190000000000145 | -1.267 | -0.634 | -0.422 |
| -3.180000000000145 | -1.266 | -0.633 | -0.422 |
| -3.170000000000146 | -1.265 | -0.633 | -0.422 |
| -3.160000000000146 | -1.264 | -0.632 | -0.421 |
| -3.150000000000146 | -1.263 | -0.632 | -0.421 |
| -3.140000000000146 | -1.262 | -0.631 | -0.421 |
| -3.130000000000146 | -1.262 | -0.631 | -0.421 |
| -3.120000000000147 | -1.261 | -0.63 | -0.42 |
| -3.110000000000147 | -1.26 | -0.63 | -0.42 |
| -3.100000000000147 | -1.259 | -0.629 | -0.42 |
| -3.090000000000147 | -1.258 | -0.629 | -0.419 |
| -3.080000000000147 | -1.257 | -0.628 | -0.419 |
| -3.070000000000148 | -1.256 | -0.628 | -0.419 |
| -3.060000000000148 | -1.255 | -0.627 | -0.418 |
| -3.050000000000148 | -1.254 | -0.627 | -0.418 |
| -3.040000000000148 | -1.253 | -0.626 | -0.418 |
| -3.030000000000149 | -1.252 | -0.626 | -0.417 |
| -3.020000000000149 | -1.251 | -0.626 | -0.417 |
| -3.010000000000149 | -1.25 | -0.625 | -0.417 |
| -3.000000000000149 | -1.249 | -0.625 | -0.416 |
| -2.990000000000149 | -1.248 | -0.624 | -0.416 |
| -2.98000000000015 | -1.247 | -0.624 | -0.416 |
| -2.97000000000015 | -1.246 | -0.623 | -0.415 |
| -2.96000000000015 | -1.245 | -0.622 | -0.415 |
| -2.95000000000015 | -1.244 | -0.622 | -0.415 |
| -2.94000000000015 | -1.243 | -0.621 | -0.414 |
| -2.930000000000151 | -1.242 | -0.621 | -0.414 |
| -2.920000000000151 | -1.241 | -0.62 | -0.414 |
| -2.910000000000151 | -1.24 | -0.62 | -0.413 |
| -2.900000000000151 | -1.239 | -0.619 | -0.413 |
| -2.890000000000151 | -1.238 | -0.619 | -0.413 |
| -2.880000000000152 | -1.237 | -0.618 | -0.412 |
| -2.870000000000152 | -1.236 | -0.618 | -0.412 |
| -2.860000000000152 | -1.234 | -0.617 | -0.411 |
| -2.850000000000152 | -1.233 | -0.617 | -0.411 |
| -2.840000000000153 | -1.232 | -0.616 | -0.411 |
| -2.830000000000153 | -1.231 | -0.616 | -0.41 |
| -2.820000000000153 | -1.23 | -0.615 | -0.41 |
| -2.810000000000153 | -1.229 | -0.614 | -0.41 |
| -2.800000000000153 | -1.228 | -0.614 | -0.409 |
| -2.790000000000154 | -1.227 | -0.613 | -0.409 |
| -2.780000000000154 | -1.225 | -0.613 | -0.408 |
| -2.770000000000154 | -1.224 | -0.612 | -0.408 |
| -2.760000000000154 | -1.223 | -0.612 | -0.408 |
| -2.750000000000154 | -1.222 | -0.611 | -0.407 |
| -2.740000000000155 | -1.221 | -0.61 | -0.407 |
| -2.730000000000155 | -1.22 | -0.61 | -0.407 |
| -2.720000000000155 | -1.218 | -0.609 | -0.406 |
| -2.710000000000155 | -1.217 | -0.609 | -0.406 |
| -2.700000000000156 | -1.216 | -0.608 | -0.405 |
| -2.690000000000156 | -1.215 | -0.607 | -0.405 |
| -2.680000000000156 | -1.214 | -0.607 | -0.405 |
| -2.670000000000156 | -1.212 | -0.606 | -0.404 |
| -2.660000000000156 | -1.211 | -0.606 | -0.404 |
| -2.650000000000157 | -1.21 | -0.605 | -0.403 |
| -2.640000000000157 | -1.209 | -0.604 | -0.403 |
| -2.630000000000157 | -1.207 | -0.604 | -0.402 |
| -2.620000000000157 | -1.206 | -0.603 | -0.402 |
| -2.610000000000157 | -1.205 | -0.602 | -0.402 |
| -2.600000000000158 | -1.204 | -0.602 | -0.401 |
| -2.590000000000158 | -1.202 | -0.601 | -0.401 |
| -2.580000000000158 | -1.201 | -0.601 | -0.4 |
| -2.570000000000158 | -1.2 | -0.6 | -0.4 |
| -2.560000000000159 | -1.198 | -0.599 | -0.399 |
| -2.550000000000159 | -1.197 | -0.599 | -0.399 |
| -2.54000000000016 | -1.196 | -0.598 | -0.399 |
| -2.530000000000159 | -1.194 | -0.597 | -0.398 |
| -2.520000000000159 | -1.193 | -0.597 | -0.398 |
| -2.51000000000016 | -1.192 | -0.596 | -0.397 |
| -2.50000000000016 | -1.19 | -0.595 | -0.397 |
| -2.49000000000016 | -1.189 | -0.594 | -0.396 |
| -2.48000000000016 | -1.188 | -0.594 | -0.396 |
| -2.47000000000016 | -1.186 | -0.593 | -0.395 |
| -2.460000000000161 | -1.185 | -0.592 | -0.395 |
| -2.450000000000161 | -1.183 | -0.592 | -0.394 |
| -2.440000000000161 | -1.182 | -0.591 | -0.394 |
| -2.430000000000161 | -1.18 | -0.59 | -0.393 |
| -2.420000000000162 | -1.179 | -0.589 | -0.393 |
| -2.410000000000162 | -1.177 | -0.589 | -0.392 |
| -2.400000000000162 | -1.176 | -0.588 | -0.392 |
| -2.390000000000162 | -1.175 | -0.587 | -0.392 |
| -2.380000000000162 | -1.173 | -0.587 | -0.391 |
| -2.370000000000163 | -1.172 | -0.586 | -0.391 |
| -2.360000000000163 | -1.17 | -0.585 | -0.39 |
| -2.350000000000163 | -1.168 | -0.584 | -0.389 |
| -2.340000000000163 | -1.167 | -0.583 | -0.389 |
| -2.330000000000163 | -1.165 | -0.583 | -0.388 |
| -2.320000000000164 | -1.164 | -0.582 | -0.388 |
| -2.310000000000164 | -1.162 | -0.581 | -0.387 |
| -2.300000000000164 | -1.161 | -0.58 | -0.387 |
| -2.290000000000164 | -1.159 | -0.58 | -0.386 |
| -2.280000000000165 | -1.157 | -0.579 | -0.386 |
| -2.270000000000165 | -1.156 | -0.578 | -0.385 |
| -2.260000000000165 | -1.154 | -0.577 | -0.385 |
| -2.250000000000165 | -1.153 | -0.576 | -0.384 |
| -2.240000000000165 | -1.151 | -0.575 | -0.384 |
| -2.230000000000166 | -1.149 | -0.575 | -0.383 |
| -2.220000000000166 | -1.148 | -0.574 | -0.383 |
| -2.210000000000166 | -1.146 | -0.573 | -0.382 |
| -2.200000000000166 | -1.144 | -0.572 | -0.381 |
| -2.190000000000166 | -1.142 | -0.571 | -0.381 |
| -2.180000000000167 | -1.141 | -0.57 | -0.38 |
| -2.170000000000167 | -1.139 | -0.569 | -0.38 |
| -2.160000000000167 | -1.137 | -0.569 | -0.379 |
| -2.150000000000167 | -1.135 | -0.568 | -0.378 |
| -2.140000000000168 | -1.134 | -0.567 | -0.378 |
| -2.130000000000168 | -1.132 | -0.566 | -0.377 |
| -2.120000000000168 | -1.13 | -0.565 | -0.377 |
| -2.110000000000168 | -1.128 | -0.564 | -0.376 |
| -2.100000000000168 | -1.126 | -0.563 | -0.375 |
| -2.090000000000169 | -1.125 | -0.562 | -0.375 |
| -2.080000000000169 | -1.123 | -0.561 | -0.374 |
| -2.070000000000169 | -1.121 | -0.56 | -0.374 |
| -2.060000000000169 | -1.119 | -0.559 | -0.373 |
| -2.050000000000169 | -1.117 | -0.558 | -0.372 |
| -2.04000000000017 | -1.115 | -0.558 | -0.372 |
| -2.03000000000017 | -1.113 | -0.557 | -0.371 |
| -2.02000000000017 | -1.111 | -0.556 | -0.37 |
| -2.01000000000017 | -1.109 | -0.555 | -0.37 |
| -2.000000000000171 | -1.107 | -0.554 | -0.369 |
| -1.99000000000017 | -1.105 | -0.553 | -0.368 |
| -1.98000000000017 | -1.103 | -0.552 | -0.368 |
| -1.97000000000017 | -1.101 | -0.551 | -0.367 |
| -1.96000000000017 | -1.099 | -0.55 | -0.366 |
| -1.95000000000017 | -1.097 | -0.548 | -0.366 |
| -1.94000000000017 | -1.095 | -0.547 | -0.365 |
| -1.93000000000017 | -1.093 | -0.546 | -0.364 |
| -1.92000000000017 | -1.091 | -0.545 | -0.364 |
| -1.91000000000017 | -1.088 | -0.544 | -0.363 |
| -1.90000000000017 | -1.086 | -0.543 | -0.362 |
| -1.89000000000017 | -1.084 | -0.542 | -0.361 |
| -1.88000000000017 | -1.082 | -0.541 | -0.361 |
| -1.87000000000017 | -1.08 | -0.54 | -0.36 |
| -1.86000000000017 | -1.077 | -0.539 | -0.359 |
| -1.85000000000017 | -1.075 | -0.538 | -0.358 |
| -1.84000000000017 | -1.073 | -0.536 | -0.358 |
| -1.83000000000017 | -1.071 | -0.535 | -0.357 |
| -1.82000000000017 | -1.068 | -0.534 | -0.356 |
| -1.81000000000017 | -1.066 | -0.533 | -0.355 |
| -1.80000000000017 | -1.064 | -0.532 | -0.355 |
| -1.79000000000017 | -1.061 | -0.531 | -0.354 |
| -1.78000000000017 | -1.059 | -0.529 | -0.353 |
| -1.77000000000017 | -1.057 | -0.528 | -0.352 |
| -1.76000000000017 | -1.054 | -0.527 | -0.351 |
| -1.75000000000017 | -1.052 | -0.526 | -0.351 |
| -1.74000000000017 | -1.049 | -0.525 | -0.35 |
| -1.73000000000017 | -1.047 | -0.523 | -0.349 |
| -1.72000000000017 | -1.044 | -0.522 | -0.348 |
| -1.71000000000017 | -1.042 | -0.521 | -0.347 |
| -1.70000000000017 | -1.039 | -0.52 | -0.346 |
| -1.69000000000017 | -1.036 | -0.518 | -0.345 |
| -1.68000000000017 | -1.034 | -0.517 | -0.345 |
| -1.67000000000017 | -1.031 | -0.516 | -0.344 |
| -1.66000000000017 | -1.029 | -0.514 | -0.343 |
| -1.65000000000017 | -1.026 | -0.513 | -0.342 |
| -1.64000000000017 | -1.023 | -0.512 | -0.341 |
| -1.63000000000017 | -1.021 | -0.51 | -0.34 |
| -1.62000000000017 | -1.018 | -0.509 | -0.339 |
| -1.61000000000017 | -1.015 | -0.507 | -0.338 |
| -1.60000000000017 | -1.012 | -0.506 | -0.337 |
| -1.59000000000017 | -1.009 | -0.505 | -0.336 |
| -1.58000000000017 | -1.007 | -0.503 | -0.336 |
| -1.57000000000017 | -1.004 | -0.502 | -0.335 |
| -1.56000000000017 | -1.001 | -0.5 | -0.334 |
| -1.55000000000017 | -0.998 | -0.499 | -0.333 |
| -1.54000000000017 | -0.995 | -0.497 | -0.332 |
| -1.53000000000017 | -0.992 | -0.496 | -0.331 |
| -1.52000000000017 | -0.989 | -0.494 | -0.33 |
| -1.51000000000017 | -0.986 | -0.493 | -0.329 |
| -1.50000000000017 | -0.983 | -0.491 | -0.328 |
| -1.49000000000017 | -0.98 | -0.49 | -0.327 |
| -1.48000000000017 | -0.977 | -0.488 | -0.326 |
| -1.47000000000017 | -0.973 | -0.487 | -0.324 |
| -1.46000000000017 | -0.97 | -0.485 | -0.323 |
| -1.45000000000017 | -0.967 | -0.484 | -0.322 |
| -1.44000000000017 | -0.964 | -0.482 | -0.321 |
| -1.43000000000017 | -0.961 | -0.48 | -0.32 |
| -1.42000000000017 | -0.957 | -0.479 | -0.319 |
| -1.41000000000017 | -0.954 | -0.477 | -0.318 |
| -1.40000000000017 | -0.951 | -0.475 | -0.317 |
| -1.39000000000017 | -0.947 | -0.474 | -0.316 |
| -1.38000000000017 | -0.944 | -0.472 | -0.315 |
| -1.37000000000017 | -0.94 | -0.47 | -0.313 |
| -1.36000000000017 | -0.937 | -0.468 | -0.312 |
| -1.35000000000017 | -0.933 | -0.467 | -0.311 |
| -1.34000000000017 | -0.93 | -0.465 | -0.31 |
| -1.33000000000017 | -0.926 | -0.463 | -0.309 |
| -1.32000000000017 | -0.922 | -0.461 | -0.307 |
| -1.31000000000017 | -0.919 | -0.459 | -0.306 |
| -1.30000000000017 | -0.915 | -0.458 | -0.305 |
| -1.29000000000017 | -0.911 | -0.456 | -0.304 |
| -1.28000000000017 | -0.908 | -0.454 | -0.303 |
| -1.27000000000017 | -0.904 | -0.452 | -0.301 |
| -1.26000000000017 | -0.9 | -0.45 | -0.3 |
| -1.25000000000017 | -0.896 | -0.448 | -0.299 |
| -1.24000000000017 | -0.892 | -0.446 | -0.297 |
| -1.23000000000017 | -0.888 | -0.444 | -0.296 |
| -1.22000000000017 | -0.884 | -0.442 | -0.295 |
| -1.21000000000017 | -0.88 | -0.44 | -0.293 |
| -1.20000000000017 | -0.876 | -0.438 | -0.292 |
| -1.19000000000017 | -0.872 | -0.436 | -0.291 |
| -1.18000000000017 | -0.868 | -0.434 | -0.289 |
| -1.17000000000017 | -0.864 | -0.432 | -0.288 |
| -1.16000000000017 | -0.859 | -0.43 | -0.286 |
| -1.15000000000017 | -0.855 | -0.428 | -0.285 |
| -1.14000000000017 | -0.851 | -0.425 | -0.284 |
| -1.13000000000017 | -0.846 | -0.423 | -0.282 |
| -1.12000000000017 | -0.842 | -0.421 | -0.281 |
| -1.11000000000017 | -0.837 | -0.419 | -0.279 |
| -1.10000000000017 | -0.833 | -0.416 | -0.278 |
| -1.09000000000017 | -0.828 | -0.414 | -0.276 |
| -1.08000000000017 | -0.824 | -0.412 | -0.275 |
| -1.07000000000017 | -0.819 | -0.41 | -0.273 |
| -1.06000000000017 | -0.815 | -0.407 | -0.272 |
| -1.05000000000017 | -0.81 | -0.405 | -0.27 |
| -1.04000000000017 | -0.805 | -0.403 | -0.268 |
| -1.03000000000017 | -0.8 | -0.4 | -0.267 |
| -1.02000000000017 | -0.795 | -0.398 | -0.265 |
| -1.01000000000017 | -0.79 | -0.395 | -0.263 |
| -1.00000000000017 | -0.785 | -0.393 | -0.262 |
| -0.99000000000017 | -0.78 | -0.39 | -0.26 |
| -0.98000000000017 | -0.775 | -0.388 | -0.258 |
| -0.97000000000017 | -0.77 | -0.385 | -0.257 |
| -0.96000000000017 | -0.765 | -0.382 | -0.255 |
| -0.95000000000017 | -0.76 | -0.38 | -0.253 |
| -0.94000000000017 | -0.754 | -0.377 | -0.251 |
| -0.93000000000017 | -0.749 | -0.375 | -0.25 |
| -0.92000000000017 | -0.744 | -0.372 | -0.248 |
| -0.91000000000017 | -0.738 | -0.369 | -0.246 |
| -0.90000000000017 | -0.733 | -0.366 | -0.244 |
| -0.890000000000169 | -0.727 | -0.364 | -0.242 |
| -0.880000000000169 | -0.722 | -0.361 | -0.241 |
| -0.870000000000169 | -0.716 | -0.358 | -0.239 |
| -0.860000000000169 | -0.71 | -0.355 | -0.237 |
| -0.850000000000169 | -0.704 | -0.352 | -0.235 |
| -0.840000000000169 | -0.699 | -0.349 | -0.233 |
| -0.830000000000169 | -0.693 | -0.346 | -0.231 |
| -0.820000000000169 | -0.687 | -0.343 | -0.229 |
| -0.810000000000169 | -0.681 | -0.34 | -0.227 |
| -0.800000000000169 | -0.675 | -0.337 | -0.225 |
| -0.790000000000169 | -0.669 | -0.334 | -0.223 |
| -0.780000000000169 | -0.662 | -0.331 | -0.221 |
| -0.770000000000169 | -0.656 | -0.328 | -0.219 |
| -0.760000000000169 | -0.65 | -0.325 | -0.217 |
| -0.750000000000169 | -0.644 | -0.322 | -0.215 |
| -0.740000000000169 | -0.637 | -0.319 | -0.212 |
| -0.730000000000169 | -0.631 | -0.315 | -0.21 |
| -0.720000000000169 | -0.624 | -0.312 | -0.208 |
| -0.710000000000169 | -0.617 | -0.309 | -0.206 |
| -0.700000000000169 | -0.611 | -0.305 | -0.204 |
| -0.690000000000169 | -0.604 | -0.302 | -0.201 |
| -0.680000000000169 | -0.597 | -0.299 | -0.199 |
| -0.670000000000169 | -0.59 | -0.295 | -0.197 |
| -0.660000000000169 | -0.583 | -0.292 | -0.194 |
| -0.650000000000169 | -0.576 | -0.288 | -0.192 |
| -0.640000000000169 | -0.569 | -0.285 | -0.19 |
| -0.630000000000169 | -0.562 | -0.281 | -0.187 |
| -0.620000000000169 | -0.555 | -0.277 | -0.185 |
| -0.610000000000169 | -0.548 | -0.274 | -0.183 |
| -0.600000000000169 | -0.54 | -0.27 | -0.18 |
| -0.590000000000169 | -0.533 | -0.267 | -0.178 |
| -0.580000000000169 | -0.526 | -0.263 | -0.175 |
| -0.570000000000169 | -0.518 | -0.259 | -0.173 |
| -0.560000000000169 | -0.51 | -0.255 | -0.17 |
| -0.550000000000169 | -0.503 | -0.251 | -0.168 |
| -0.540000000000169 | -0.495 | -0.248 | -0.165 |
| -0.530000000000169 | -0.487 | -0.244 | -0.162 |
| -0.520000000000169 | -0.48 | -0.24 | -0.16 |
| -0.510000000000169 | -0.472 | -0.236 | -0.157 |
| -0.500000000000169 | -0.464 | -0.232 | -0.155 |
| -0.490000000000169 | -0.456 | -0.228 | -0.152 |
| -0.480000000000169 | -0.448 | -0.224 | -0.149 |
| -0.470000000000169 | -0.439 | -0.22 | -0.146 |
| -0.460000000000169 | -0.431 | -0.216 | -0.144 |
| -0.450000000000169 | -0.423 | -0.211 | -0.141 |
| -0.440000000000169 | -0.415 | -0.207 | -0.138 |
| -0.430000000000169 | -0.406 | -0.203 | -0.135 |
| -0.420000000000169 | -0.398 | -0.199 | -0.133 |
| -0.410000000000169 | -0.389 | -0.195 | -0.13 |
| -0.400000000000169 | -0.381 | -0.19 | -0.127 |
| -0.390000000000169 | -0.372 | -0.186 | -0.124 |
| -0.380000000000169 | -0.363 | -0.182 | -0.121 |
| -0.370000000000169 | -0.354 | -0.177 | -0.118 |
| -0.360000000000169 | -0.346 | -0.173 | -0.115 |
| -0.350000000000169 | -0.337 | -0.168 | -0.112 |
| -0.340000000000169 | -0.328 | -0.164 | -0.109 |
| -0.330000000000169 | -0.319 | -0.159 | -0.106 |
| -0.320000000000169 | -0.31 | -0.155 | -0.103 |
| -0.310000000000169 | -0.301 | -0.15 | -0.1 |
| -0.300000000000169 | -0.291 | -0.146 | -0.097 |
| -0.290000000000169 | -0.282 | -0.141 | -0.094 |
| -0.280000000000169 | -0.273 | -0.137 | -0.091 |
| -0.270000000000169 | -0.264 | -0.132 | -0.088 |
| -0.260000000000169 | -0.254 | -0.127 | -0.085 |
| -0.250000000000169 | -0.245 | -0.122 | -0.082 |
| -0.240000000000169 | -0.236 | -0.118 | -0.079 |
| -0.230000000000169 | -0.226 | -0.113 | -0.075 |
| -0.220000000000169 | -0.217 | -0.108 | -0.072 |
| -0.210000000000169 | -0.207 | -0.103 | -0.069 |
| -0.200000000000169 | -0.197 | -0.099 | -0.066 |
| -0.190000000000169 | -0.188 | -0.094 | -0.063 |
| -0.180000000000169 | -0.178 | -0.089 | -0.059 |
| -0.170000000000169 | -0.168 | -0.084 | -0.056 |
| -0.160000000000169 | -0.159 | -0.079 | -0.053 |
| -0.150000000000169 | -0.149 | -0.074 | -0.05 |
| -0.140000000000169 | -0.139 | -0.07 | -0.046 |
| -0.130000000000169 | -0.129 | -0.065 | -0.043 |
| -0.120000000000169 | -0.119 | -0.06 | -0.04 |
| -0.110000000000169 | -0.11 | -0.055 | -0.037 |
| -0.100000000000169 | -0.1 | -0.05 | -0.033 |
| -0.0900000000001689 | -0.09 | -0.045 | -0.03 |
| -0.0800000000001689 | -0.08 | -0.04 | -0.027 |
| -0.0700000000001689 | -0.07 | -0.035 | -0.023 |
| -0.0600000000001689 | -0.06 | -0.03 | -0.02 |
| -0.0500000000001689 | -0.05 | -0.025 | -0.017 |
| -0.0400000000001689 | -0.04 | -0.02 | -0.013 |
| -0.0300000000001689 | -0.03 | -0.015 | -0.01 |
| -0.0200000000001689 | -0.02 | -0.01 | -0.007 |
| -0.0100000000001689 | -0.01 | -0.005 | -0.003 |
| -1.6888920817415e-13 | 0 | 0 | 0 |
| 0.00999999999983111 | 0.01 | 0.005 | 0.003 |
| 0.0199999999998311 | 0.02 | 0.01 | 0.007 |
| 0.0299999999998311 | 0.03 | 0.015 | 0.01 |
| 0.0399999999998311 | 0.04 | 0.02 | 0.013 |
| 0.0499999999998311 | 0.05 | 0.025 | 0.017 |
| 0.0599999999998311 | 0.06 | 0.03 | 0.02 |
| 0.0699999999998311 | 0.07 | 0.035 | 0.023 |
| 0.0799999999998311 | 0.08 | 0.04 | 0.027 |
| 0.0899999999998311 | 0.09 | 0.045 | 0.03 |
| 0.0999999999998311 | 0.1 | 0.05 | 0.033 |
| 0.109999999999831 | 0.11 | 0.055 | 0.037 |
| 0.119999999999831 | 0.119 | 0.06 | 0.04 |
| 0.129999999999831 | 0.129 | 0.065 | 0.043 |
| 0.139999999999831 | 0.139 | 0.07 | 0.046 |
| 0.149999999999831 | 0.149 | 0.074 | 0.05 |
| 0.159999999999831 | 0.159 | 0.079 | 0.053 |
| 0.169999999999831 | 0.168 | 0.084 | 0.056 |
| 0.179999999999831 | 0.178 | 0.089 | 0.059 |
| 0.189999999999831 | 0.188 | 0.094 | 0.063 |
| 0.199999999999831 | 0.197 | 0.099 | 0.066 |
| 0.209999999999831 | 0.207 | 0.103 | 0.069 |
| 0.219999999999831 | 0.217 | 0.108 | 0.072 |
| 0.229999999999831 | 0.226 | 0.113 | 0.075 |
| 0.239999999999831 | 0.236 | 0.118 | 0.079 |
| 0.249999999999831 | 0.245 | 0.122 | 0.082 |
| 0.259999999999831 | 0.254 | 0.127 | 0.085 |
| 0.269999999999831 | 0.264 | 0.132 | 0.088 |
| 0.279999999999831 | 0.273 | 0.137 | 0.091 |
| 0.289999999999831 | 0.282 | 0.141 | 0.094 |
| 0.299999999999831 | 0.291 | 0.146 | 0.097 |
| 0.309999999999831 | 0.301 | 0.15 | 0.1 |
| 0.319999999999831 | 0.31 | 0.155 | 0.103 |
| 0.329999999999831 | 0.319 | 0.159 | 0.106 |
| 0.339999999999831 | 0.328 | 0.164 | 0.109 |
| 0.349999999999831 | 0.337 | 0.168 | 0.112 |
| 0.359999999999831 | 0.346 | 0.173 | 0.115 |
| 0.369999999999831 | 0.354 | 0.177 | 0.118 |
| 0.379999999999831 | 0.363 | 0.182 | 0.121 |
| 0.389999999999831 | 0.372 | 0.186 | 0.124 |
| 0.399999999999831 | 0.381 | 0.19 | 0.127 |
| 0.409999999999831 | 0.389 | 0.195 | 0.13 |
| 0.419999999999831 | 0.398 | 0.199 | 0.133 |
| 0.429999999999831 | 0.406 | 0.203 | 0.135 |
| 0.439999999999831 | 0.415 | 0.207 | 0.138 |
| 0.449999999999831 | 0.423 | 0.211 | 0.141 |
| 0.459999999999831 | 0.431 | 0.216 | 0.144 |
| 0.469999999999831 | 0.439 | 0.22 | 0.146 |
| 0.479999999999831 | 0.448 | 0.224 | 0.149 |
| 0.489999999999831 | 0.456 | 0.228 | 0.152 |
| 0.499999999999831 | 0.464 | 0.232 | 0.155 |
| 0.509999999999831 | 0.472 | 0.236 | 0.157 |
| 0.519999999999831 | 0.48 | 0.24 | 0.16 |
| 0.529999999999831 | 0.487 | 0.244 | 0.162 |
| 0.539999999999831 | 0.495 | 0.248 | 0.165 |
| 0.549999999999831 | 0.503 | 0.251 | 0.168 |
| 0.559999999999831 | 0.51 | 0.255 | 0.17 |
| 0.569999999999831 | 0.518 | 0.259 | 0.173 |
| 0.579999999999831 | 0.526 | 0.263 | 0.175 |
| 0.589999999999831 | 0.533 | 0.267 | 0.178 |
| 0.599999999999831 | 0.54 | 0.27 | 0.18 |
| 0.609999999999831 | 0.548 | 0.274 | 0.183 |
| 0.619999999999831 | 0.555 | 0.277 | 0.185 |
| 0.629999999999831 | 0.562 | 0.281 | 0.187 |
| 0.639999999999831 | 0.569 | 0.285 | 0.19 |
| 0.649999999999831 | 0.576 | 0.288 | 0.192 |
| 0.659999999999831 | 0.583 | 0.292 | 0.194 |
| 0.669999999999831 | 0.59 | 0.295 | 0.197 |
| 0.679999999999831 | 0.597 | 0.299 | 0.199 |
| 0.689999999999831 | 0.604 | 0.302 | 0.201 |
| 0.699999999999831 | 0.611 | 0.305 | 0.204 |
| 0.709999999999831 | 0.617 | 0.309 | 0.206 |
| 0.719999999999831 | 0.624 | 0.312 | 0.208 |
| 0.729999999999831 | 0.631 | 0.315 | 0.21 |
| 0.739999999999831 | 0.637 | 0.319 | 0.212 |
| 0.749999999999832 | 0.644 | 0.322 | 0.215 |
| 0.759999999999832 | 0.65 | 0.325 | 0.217 |
| 0.769999999999832 | 0.656 | 0.328 | 0.219 |
| 0.779999999999832 | 0.662 | 0.331 | 0.221 |
| 0.789999999999832 | 0.669 | 0.334 | 0.223 |
| 0.799999999999832 | 0.675 | 0.337 | 0.225 |
| 0.809999999999832 | 0.681 | 0.34 | 0.227 |
| 0.819999999999832 | 0.687 | 0.343 | 0.229 |
| 0.829999999999832 | 0.693 | 0.346 | 0.231 |
| 0.839999999999832 | 0.699 | 0.349 | 0.233 |
| 0.849999999999832 | 0.704 | 0.352 | 0.235 |
| 0.859999999999832 | 0.71 | 0.355 | 0.237 |
| 0.869999999999832 | 0.716 | 0.358 | 0.239 |
| 0.879999999999832 | 0.722 | 0.361 | 0.241 |
| 0.889999999999832 | 0.727 | 0.364 | 0.242 |
| 0.899999999999832 | 0.733 | 0.366 | 0.244 |
| 0.909999999999832 | 0.738 | 0.369 | 0.246 |
| 0.919999999999832 | 0.744 | 0.372 | 0.248 |
| 0.929999999999832 | 0.749 | 0.375 | 0.25 |
| 0.939999999999832 | 0.754 | 0.377 | 0.251 |
| 0.949999999999832 | 0.76 | 0.38 | 0.253 |
| 0.959999999999832 | 0.765 | 0.382 | 0.255 |
| 0.969999999999832 | 0.77 | 0.385 | 0.257 |
| 0.979999999999832 | 0.775 | 0.388 | 0.258 |
| 0.989999999999832 | 0.78 | 0.39 | 0.26 |
| 0.999999999999832 | 0.785 | 0.393 | 0.262 |
| 1.009999999999832 | 0.79 | 0.395 | 0.263 |
| 1.019999999999832 | 0.795 | 0.398 | 0.265 |
| 1.029999999999832 | 0.8 | 0.4 | 0.267 |
| 1.039999999999832 | 0.805 | 0.403 | 0.268 |
| 1.049999999999832 | 0.81 | 0.405 | 0.27 |
| 1.059999999999832 | 0.815 | 0.407 | 0.272 |
| 1.069999999999832 | 0.819 | 0.41 | 0.273 |
| 1.079999999999832 | 0.824 | 0.412 | 0.275 |
| 1.089999999999832 | 0.828 | 0.414 | 0.276 |
| 1.099999999999832 | 0.833 | 0.416 | 0.278 |
| 1.109999999999832 | 0.837 | 0.419 | 0.279 |
| 1.119999999999832 | 0.842 | 0.421 | 0.281 |
| 1.129999999999832 | 0.846 | 0.423 | 0.282 |
| 1.139999999999832 | 0.851 | 0.425 | 0.284 |
| 1.149999999999832 | 0.855 | 0.428 | 0.285 |
| 1.159999999999832 | 0.859 | 0.43 | 0.286 |
| 1.169999999999832 | 0.864 | 0.432 | 0.288 |
| 1.179999999999832 | 0.868 | 0.434 | 0.289 |
| 1.189999999999832 | 0.872 | 0.436 | 0.291 |
| 1.199999999999832 | 0.876 | 0.438 | 0.292 |
| 1.209999999999832 | 0.88 | 0.44 | 0.293 |
| 1.219999999999832 | 0.884 | 0.442 | 0.295 |
| 1.229999999999832 | 0.888 | 0.444 | 0.296 |
| 1.239999999999832 | 0.892 | 0.446 | 0.297 |
| 1.249999999999832 | 0.896 | 0.448 | 0.299 |
| 1.259999999999832 | 0.9 | 0.45 | 0.3 |
| 1.269999999999832 | 0.904 | 0.452 | 0.301 |
| 1.279999999999832 | 0.908 | 0.454 | 0.303 |
| 1.289999999999832 | 0.911 | 0.456 | 0.304 |
| 1.299999999999832 | 0.915 | 0.458 | 0.305 |
| 1.309999999999832 | 0.919 | 0.459 | 0.306 |
| 1.319999999999832 | 0.922 | 0.461 | 0.307 |
| 1.329999999999832 | 0.926 | 0.463 | 0.309 |
| 1.339999999999832 | 0.93 | 0.465 | 0.31 |
| 1.349999999999832 | 0.933 | 0.467 | 0.311 |
| 1.359999999999832 | 0.937 | 0.468 | 0.312 |
| 1.369999999999832 | 0.94 | 0.47 | 0.313 |
| 1.379999999999832 | 0.944 | 0.472 | 0.315 |
| 1.389999999999832 | 0.947 | 0.474 | 0.316 |
| 1.399999999999832 | 0.951 | 0.475 | 0.317 |
| 1.409999999999832 | 0.954 | 0.477 | 0.318 |
| 1.419999999999832 | 0.957 | 0.479 | 0.319 |
| 1.429999999999832 | 0.961 | 0.48 | 0.32 |
| 1.439999999999832 | 0.964 | 0.482 | 0.321 |
| 1.449999999999832 | 0.967 | 0.484 | 0.322 |
| 1.459999999999832 | 0.97 | 0.485 | 0.323 |
| 1.469999999999832 | 0.973 | 0.487 | 0.324 |
| 1.479999999999832 | 0.977 | 0.488 | 0.326 |
| 1.489999999999832 | 0.98 | 0.49 | 0.327 |
| 1.499999999999832 | 0.983 | 0.491 | 0.328 |
| 1.509999999999832 | 0.986 | 0.493 | 0.329 |
| 1.519999999999832 | 0.989 | 0.494 | 0.33 |
| 1.529999999999832 | 0.992 | 0.496 | 0.331 |
| 1.539999999999832 | 0.995 | 0.497 | 0.332 |
| 1.549999999999832 | 0.998 | 0.499 | 0.333 |
| 1.559999999999832 | 1.001 | 0.5 | 0.334 |
| 1.569999999999832 | 1.004 | 0.502 | 0.335 |
| 1.579999999999832 | 1.007 | 0.503 | 0.336 |
| 1.589999999999832 | 1.009 | 0.505 | 0.336 |
| 1.599999999999832 | 1.012 | 0.506 | 0.337 |
| 1.609999999999832 | 1.015 | 0.507 | 0.338 |
| 1.619999999999832 | 1.018 | 0.509 | 0.339 |
| 1.629999999999832 | 1.021 | 0.51 | 0.34 |
| 1.639999999999832 | 1.023 | 0.512 | 0.341 |
| 1.649999999999832 | 1.026 | 0.513 | 0.342 |
| 1.659999999999832 | 1.029 | 0.514 | 0.343 |
| 1.669999999999832 | 1.031 | 0.516 | 0.344 |
| 1.679999999999832 | 1.034 | 0.517 | 0.345 |
| 1.689999999999832 | 1.036 | 0.518 | 0.345 |
| 1.699999999999832 | 1.039 | 0.52 | 0.346 |
| 1.709999999999832 | 1.042 | 0.521 | 0.347 |
| 1.719999999999832 | 1.044 | 0.522 | 0.348 |
| 1.729999999999832 | 1.047 | 0.523 | 0.349 |
| 1.739999999999832 | 1.049 | 0.525 | 0.35 |
| 1.749999999999832 | 1.052 | 0.526 | 0.351 |
| 1.759999999999832 | 1.054 | 0.527 | 0.351 |
| 1.769999999999832 | 1.057 | 0.528 | 0.352 |
| 1.779999999999832 | 1.059 | 0.529 | 0.353 |
| 1.789999999999832 | 1.061 | 0.531 | 0.354 |
| 1.799999999999832 | 1.064 | 0.532 | 0.355 |
| 1.809999999999832 | 1.066 | 0.533 | 0.355 |
| 1.819999999999832 | 1.068 | 0.534 | 0.356 |
| 1.829999999999832 | 1.071 | 0.535 | 0.357 |
| 1.839999999999832 | 1.073 | 0.536 | 0.358 |
| 1.849999999999832 | 1.075 | 0.538 | 0.358 |
| 1.859999999999832 | 1.077 | 0.539 | 0.359 |
| 1.869999999999832 | 1.08 | 0.54 | 0.36 |
| 1.879999999999832 | 1.082 | 0.541 | 0.361 |
| 1.889999999999832 | 1.084 | 0.542 | 0.361 |
| 1.899999999999832 | 1.086 | 0.543 | 0.362 |
| 1.909999999999832 | 1.088 | 0.544 | 0.363 |
| 1.919999999999832 | 1.091 | 0.545 | 0.364 |
| 1.929999999999832 | 1.093 | 0.546 | 0.364 |
| 1.939999999999832 | 1.095 | 0.547 | 0.365 |
| 1.949999999999833 | 1.097 | 0.548 | 0.366 |
| 1.959999999999833 | 1.099 | 0.55 | 0.366 |
| 1.969999999999833 | 1.101 | 0.551 | 0.367 |
| 1.979999999999833 | 1.103 | 0.552 | 0.368 |
| 1.989999999999833 | 1.105 | 0.553 | 0.368 |
| 1.999999999999833 | 1.107 | 0.554 | 0.369 |
| 2.009999999999832 | 1.109 | 0.555 | 0.37 |
| 2.019999999999832 | 1.111 | 0.556 | 0.37 |
| 2.029999999999832 | 1.113 | 0.557 | 0.371 |
| 2.039999999999832 | 1.115 | 0.558 | 0.372 |
| 2.049999999999832 | 1.117 | 0.558 | 0.372 |
| 2.059999999999831 | 1.119 | 0.559 | 0.373 |
| 2.069999999999831 | 1.121 | 0.56 | 0.374 |
| 2.079999999999831 | 1.123 | 0.561 | 0.374 |
| 2.089999999999831 | 1.125 | 0.562 | 0.375 |
| 2.09999999999983 | 1.126 | 0.563 | 0.375 |
| 2.10999999999983 | 1.128 | 0.564 | 0.376 |
| 2.11999999999983 | 1.13 | 0.565 | 0.377 |
| 2.12999999999983 | 1.132 | 0.566 | 0.377 |
| 2.13999999999983 | 1.134 | 0.567 | 0.378 |
| 2.149999999999829 | 1.135 | 0.568 | 0.378 |
| 2.159999999999829 | 1.137 | 0.569 | 0.379 |
| 2.169999999999829 | 1.139 | 0.569 | 0.38 |
| 2.179999999999829 | 1.141 | 0.57 | 0.38 |
| 2.189999999999829 | 1.142 | 0.571 | 0.381 |
| 2.199999999999828 | 1.144 | 0.572 | 0.381 |
| 2.209999999999828 | 1.146 | 0.573 | 0.382 |
| 2.219999999999828 | 1.148 | 0.574 | 0.383 |
| 2.229999999999828 | 1.149 | 0.575 | 0.383 |
| 2.239999999999827 | 1.151 | 0.575 | 0.384 |
| 2.249999999999827 | 1.153 | 0.576 | 0.384 |
| 2.259999999999827 | 1.154 | 0.577 | 0.385 |
| 2.269999999999827 | 1.156 | 0.578 | 0.385 |
| 2.279999999999827 | 1.157 | 0.579 | 0.386 |
| 2.289999999999826 | 1.159 | 0.58 | 0.386 |
| 2.299999999999826 | 1.161 | 0.58 | 0.387 |
| 2.309999999999826 | 1.162 | 0.581 | 0.387 |
| 2.319999999999826 | 1.164 | 0.582 | 0.388 |
| 2.329999999999825 | 1.165 | 0.583 | 0.388 |
| 2.339999999999825 | 1.167 | 0.583 | 0.389 |
| 2.349999999999825 | 1.168 | 0.584 | 0.389 |
| 2.359999999999825 | 1.17 | 0.585 | 0.39 |
| 2.369999999999825 | 1.172 | 0.586 | 0.391 |
| 2.379999999999824 | 1.173 | 0.587 | 0.391 |
| 2.389999999999824 | 1.175 | 0.587 | 0.392 |
| 2.399999999999824 | 1.176 | 0.588 | 0.392 |
| 2.409999999999824 | 1.177 | 0.589 | 0.392 |
| 2.419999999999824 | 1.179 | 0.589 | 0.393 |
| 2.429999999999823 | 1.18 | 0.59 | 0.393 |
| 2.439999999999823 | 1.182 | 0.591 | 0.394 |
| 2.449999999999823 | 1.183 | 0.592 | 0.394 |
| 2.459999999999823 | 1.185 | 0.592 | 0.395 |
| 2.469999999999823 | 1.186 | 0.593 | 0.395 |
| 2.479999999999822 | 1.188 | 0.594 | 0.396 |
| 2.489999999999822 | 1.189 | 0.594 | 0.396 |
| 2.499999999999822 | 1.19 | 0.595 | 0.397 |
| 2.509999999999822 | 1.192 | 0.596 | 0.397 |
| 2.519999999999821 | 1.193 | 0.597 | 0.398 |
| 2.529999999999821 | 1.194 | 0.597 | 0.398 |
| 2.539999999999821 | 1.196 | 0.598 | 0.399 |
| 2.549999999999821 | 1.197 | 0.599 | 0.399 |
| 2.559999999999821 | 1.198 | 0.599 | 0.399 |
| 2.56999999999982 | 1.2 | 0.6 | 0.4 |
| 2.57999999999982 | 1.201 | 0.601 | 0.4 |
| 2.58999999999982 | 1.202 | 0.601 | 0.401 |
| 2.59999999999982 | 1.204 | 0.602 | 0.401 |
| 2.609999999999819 | 1.205 | 0.602 | 0.402 |
| 2.619999999999819 | 1.206 | 0.603 | 0.402 |
| 2.629999999999819 | 1.207 | 0.604 | 0.402 |
| 2.639999999999819 | 1.209 | 0.604 | 0.403 |
| 2.649999999999819 | 1.21 | 0.605 | 0.403 |
| 2.659999999999818 | 1.211 | 0.606 | 0.404 |
| 2.669999999999818 | 1.212 | 0.606 | 0.404 |
| 2.679999999999818 | 1.214 | 0.607 | 0.405 |
| 2.689999999999818 | 1.215 | 0.607 | 0.405 |
| 2.699999999999818 | 1.216 | 0.608 | 0.405 |
| 2.709999999999817 | 1.217 | 0.609 | 0.406 |
| 2.719999999999817 | 1.218 | 0.609 | 0.406 |
| 2.729999999999817 | 1.22 | 0.61 | 0.407 |
| 2.739999999999817 | 1.221 | 0.61 | 0.407 |
| 2.749999999999817 | 1.222 | 0.611 | 0.407 |
| 2.759999999999816 | 1.223 | 0.612 | 0.408 |
| 2.769999999999816 | 1.224 | 0.612 | 0.408 |
| 2.779999999999816 | 1.225 | 0.613 | 0.408 |
| 2.789999999999816 | 1.227 | 0.613 | 0.409 |
| 2.799999999999815 | 1.228 | 0.614 | 0.409 |
| 2.809999999999815 | 1.229 | 0.614 | 0.41 |
| 2.819999999999815 | 1.23 | 0.615 | 0.41 |
| 2.829999999999815 | 1.231 | 0.616 | 0.41 |
| 2.839999999999815 | 1.232 | 0.616 | 0.411 |
| 2.849999999999814 | 1.233 | 0.617 | 0.411 |
| 2.859999999999814 | 1.234 | 0.617 | 0.411 |
| 2.869999999999814 | 1.236 | 0.618 | 0.412 |
| 2.879999999999814 | 1.237 | 0.618 | 0.412 |
| 2.889999999999814 | 1.238 | 0.619 | 0.413 |
| 2.899999999999813 | 1.239 | 0.619 | 0.413 |
| 2.909999999999813 | 1.24 | 0.62 | 0.413 |
| 2.919999999999813 | 1.241 | 0.62 | 0.414 |
| 2.929999999999813 | 1.242 | 0.621 | 0.414 |
| 2.939999999999813 | 1.243 | 0.621 | 0.414 |
| 2.949999999999812 | 1.244 | 0.622 | 0.415 |
| 2.959999999999812 | 1.245 | 0.622 | 0.415 |
| 2.969999999999812 | 1.246 | 0.623 | 0.415 |
| 2.979999999999812 | 1.247 | 0.624 | 0.416 |
| 2.989999999999811 | 1.248 | 0.624 | 0.416 |
| 2.999999999999811 | 1.249 | 0.625 | 0.416 |
| 3.009999999999811 | 1.25 | 0.625 | 0.417 |
| 3.019999999999811 | 1.251 | 0.626 | 0.417 |
| 3.029999999999811 | 1.252 | 0.626 | 0.417 |
| 3.03999999999981 | 1.253 | 0.626 | 0.418 |
| 3.04999999999981 | 1.254 | 0.627 | 0.418 |
| 3.05999999999981 | 1.255 | 0.627 | 0.418 |
| 3.06999999999981 | 1.256 | 0.628 | 0.419 |
| 3.07999999999981 | 1.257 | 0.628 | 0.419 |
| 3.089999999999809 | 1.258 | 0.629 | 0.419 |
| 3.099999999999809 | 1.259 | 0.629 | 0.42 |
| 3.109999999999809 | 1.26 | 0.63 | 0.42 |
| 3.119999999999809 | 1.261 | 0.63 | 0.42 |
| 3.129999999999808 | 1.262 | 0.631 | 0.421 |
| 3.139999999999808 | 1.262 | 0.631 | 0.421 |
| 3.149999999999808 | 1.263 | 0.632 | 0.421 |
| 3.159999999999808 | 1.264 | 0.632 | 0.421 |
| 3.169999999999808 | 1.265 | 0.633 | 0.422 |
| 3.179999999999807 | 1.266 | 0.633 | 0.422 |
| 3.189999999999807 | 1.267 | 0.634 | 0.422 |
| 3.199999999999807 | 1.268 | 0.634 | 0.423 |
| 3.209999999999807 | 1.269 | 0.634 | 0.423 |
| 3.219999999999807 | 1.27 | 0.635 | 0.423 |
| 3.229999999999806 | 1.271 | 0.635 | 0.424 |
| 3.239999999999806 | 1.271 | 0.636 | 0.424 |
| 3.249999999999806 | 1.272 | 0.636 | 0.424 |
| 3.259999999999806 | 1.273 | 0.637 | 0.424 |
| 3.269999999999805 | 1.274 | 0.637 | 0.425 |
| 3.279999999999805 | 1.275 | 0.637 | 0.425 |
| 3.289999999999805 | 1.276 | 0.638 | 0.425 |
| 3.299999999999805 | 1.277 | 0.638 | 0.426 |
| 3.309999999999805 | 1.277 | 0.639 | 0.426 |
| 3.319999999999804 | 1.278 | 0.639 | 0.426 |
| 3.329999999999804 | 1.279 | 0.64 | 0.426 |
| 3.339999999999804 | 1.28 | 0.64 | 0.427 |
| 3.349999999999804 | 1.281 | 0.64 | 0.427 |
| 3.359999999999804 | 1.282 | 0.641 | 0.427 |
| 3.369999999999803 | 1.282 | 0.641 | 0.427 |
| 3.379999999999803 | 1.283 | 0.642 | 0.428 |
| 3.389999999999803 | 1.284 | 0.642 | 0.428 |
| 3.399999999999803 | 1.285 | 0.642 | 0.428 |
| 3.409999999999802 | 1.286 | 0.643 | 0.429 |
| 3.419999999999802 | 1.286 | 0.643 | 0.429 |
| 3.429999999999802 | 1.287 | 0.644 | 0.429 |
| 3.439999999999802 | 1.288 | 0.644 | 0.429 |
| 3.449999999999802 | 1.289 | 0.644 | 0.43 |
| 3.459999999999801 | 1.289 | 0.645 | 0.43 |
| 3.469999999999801 | 1.29 | 0.645 | 0.43 |
| 3.479999999999801 | 1.291 | 0.645 | 0.43 |
| 3.489999999999801 | 1.292 | 0.646 | 0.431 |
| 3.499999999999801 | 1.292 | 0.646 | 0.431 |
| 3.5099999999998 | 1.293 | 0.647 | 0.431 |
| 3.5199999999998 | 1.294 | 0.647 | 0.431 |
| 3.5299999999998 | 1.295 | 0.647 | 0.432 |
| 3.5399999999998 | 1.295 | 0.648 | 0.432 |
| 3.5499999999998 | 1.296 | 0.648 | 0.432 |
| 3.559999999999799 | 1.297 | 0.648 | 0.432 |
| 3.569999999999799 | 1.298 | 0.649 | 0.433 |
| 3.579999999999799 | 1.298 | 0.649 | 0.433 |
| 3.589999999999799 | 1.299 | 0.65 | 0.433 |
| 3.599999999999798 | 1.3 | 0.65 | 0.433 |
| 3.609999999999798 | 1.301 | 0.65 | 0.434 |
| 3.619999999999798 | 1.301 | 0.651 | 0.434 |
| 3.629999999999798 | 1.302 | 0.651 | 0.434 |
| 3.639999999999798 | 1.303 | 0.651 | 0.434 |
| 3.649999999999797 | 1.303 | 0.652 | 0.434 |
| 3.659999999999797 | 1.304 | 0.652 | 0.435 |
| 3.669999999999797 | 1.305 | 0.652 | 0.435 |
| 3.679999999999797 | 1.305 | 0.653 | 0.435 |
| 3.689999999999796 | 1.306 | 0.653 | 0.435 |
| 3.699999999999796 | 1.307 | 0.653 | 0.436 |
| 3.709999999999796 | 1.308 | 0.654 | 0.436 |
| 3.719999999999796 | 1.308 | 0.654 | 0.436 |
| 3.729999999999796 | 1.309 | 0.654 | 0.436 |
| 3.739999999999795 | 1.31 | 0.655 | 0.437 |
| 3.749999999999795 | 1.31 | 0.655 | 0.437 |
| 3.759999999999795 | 1.311 | 0.655 | 0.437 |
| 3.769999999999795 | 1.312 | 0.656 | 0.437 |
| 3.779999999999795 | 1.312 | 0.656 | 0.437 |
| 3.789999999999794 | 1.313 | 0.656 | 0.438 |
| 3.799999999999794 | 1.313 | 0.657 | 0.438 |
| 3.809999999999794 | 1.314 | 0.657 | 0.438 |
| 3.819999999999794 | 1.315 | 0.657 | 0.438 |
| 3.829999999999794 | 1.315 | 0.658 | 0.438 |
| 3.839999999999793 | 1.316 | 0.658 | 0.439 |
| 3.849999999999793 | 1.317 | 0.658 | 0.439 |
| 3.859999999999793 | 1.317 | 0.659 | 0.439 |
| 3.869999999999793 | 1.318 | 0.659 | 0.439 |
| 3.879999999999792 | 1.319 | 0.659 | 0.44 |
| 3.889999999999792 | 1.319 | 0.66 | 0.44 |
| 3.899999999999792 | 1.32 | 0.66 | 0.44 |
| 3.909999999999792 | 1.32 | 0.66 | 0.44 |
| 3.919999999999792 | 1.321 | 0.661 | 0.44 |
| 3.929999999999791 | 1.322 | 0.661 | 0.441 |
| 3.939999999999791 | 1.322 | 0.661 | 0.441 |
| 3.949999999999791 | 1.323 | 0.661 | 0.441 |
| 3.959999999999791 | 1.323 | 0.662 | 0.441 |
| 3.969999999999791 | 1.324 | 0.662 | 0.441 |
| 3.97999999999979 | 1.325 | 0.662 | 0.442 |
| 3.98999999999979 | 1.325 | 0.663 | 0.442 |
| 3.99999999999979 | 1.326 | 0.663 | 0.442 |
| 4.00999999999979 | 1.326 | 0.663 | 0.442 |
| 4.01999999999979 | 1.327 | 0.663 | 0.442 |
| 4.02999999999979 | 1.328 | 0.664 | 0.443 |
| 4.03999999999979 | 1.328 | 0.664 | 0.443 |
| 4.04999999999979 | 1.329 | 0.664 | 0.443 |
| 4.05999999999979 | 1.329 | 0.665 | 0.443 |
| 4.069999999999789 | 1.33 | 0.665 | 0.443 |
| 4.079999999999788 | 1.33 | 0.665 | 0.443 |
| 4.089999999999788 | 1.331 | 0.666 | 0.444 |
| 4.099999999999788 | 1.332 | 0.666 | 0.444 |
| 4.109999999999788 | 1.332 | 0.666 | 0.444 |
| 4.119999999999788 | 1.333 | 0.666 | 0.444 |
| 4.129999999999788 | 1.333 | 0.667 | 0.444 |
| 4.139999999999787 | 1.334 | 0.667 | 0.445 |
| 4.149999999999787 | 1.334 | 0.667 | 0.445 |
| 4.159999999999787 | 1.335 | 0.667 | 0.445 |
| 4.169999999999787 | 1.335 | 0.668 | 0.445 |
| 4.179999999999786 | 1.336 | 0.668 | 0.445 |
| 4.189999999999786 | 1.337 | 0.668 | 0.446 |
| 4.199999999999786 | 1.337 | 0.669 | 0.446 |
| 4.209999999999785 | 1.338 | 0.669 | 0.446 |
| 4.219999999999785 | 1.338 | 0.669 | 0.446 |
| 4.229999999999785 | 1.339 | 0.669 | 0.446 |
| 4.239999999999785 | 1.339 | 0.67 | 0.446 |
| 4.249999999999785 | 1.34 | 0.67 | 0.447 |
| 4.259999999999784 | 1.34 | 0.67 | 0.447 |
| 4.269999999999784 | 1.341 | 0.67 | 0.447 |
| 4.279999999999784 | 1.341 | 0.671 | 0.447 |
| 4.289999999999784 | 1.342 | 0.671 | 0.447 |
| 4.299999999999784 | 1.342 | 0.671 | 0.447 |
| 4.309999999999784 | 1.343 | 0.671 | 0.448 |
| 4.319999999999784 | 1.343 | 0.672 | 0.448 |
| 4.329999999999783 | 1.344 | 0.672 | 0.448 |
| 4.339999999999783 | 1.344 | 0.672 | 0.448 |
| 4.349999999999783 | 1.345 | 0.672 | 0.448 |
| 4.359999999999783 | 1.345 | 0.673 | 0.448 |
| 4.369999999999782 | 1.346 | 0.673 | 0.449 |
| 4.379999999999782 | 1.346 | 0.673 | 0.449 |
| 4.389999999999782 | 1.347 | 0.673 | 0.449 |
| 4.399999999999782 | 1.347 | 0.674 | 0.449 |
| 4.409999999999781 | 1.348 | 0.674 | 0.449 |
| 4.419999999999781 | 1.348 | 0.674 | 0.449 |
| 4.429999999999781 | 1.349 | 0.674 | 0.45 |
| 4.43999999999978 | 1.349 | 0.675 | 0.45 |
| 4.44999999999978 | 1.35 | 0.675 | 0.45 |
| 4.45999999999978 | 1.35 | 0.675 | 0.45 |
| 4.46999999999978 | 1.351 | 0.675 | 0.45 |
| 4.47999999999978 | 1.351 | 0.676 | 0.45 |
| 4.48999999999978 | 1.352 | 0.676 | 0.451 |
| 4.49999999999978 | 1.352 | 0.676 | 0.451 |
| 4.50999999999978 | 1.353 | 0.676 | 0.451 |
| 4.51999999999978 | 1.353 | 0.677 | 0.451 |
| 4.52999999999978 | 1.354 | 0.677 | 0.451 |
| 4.539999999999778 | 1.354 | 0.677 | 0.451 |
| 4.549999999999778 | 1.354 | 0.677 | 0.451 |
| 4.559999999999778 | 1.355 | 0.677 | 0.452 |
| 4.569999999999778 | 1.355 | 0.678 | 0.452 |
| 4.579999999999778 | 1.356 | 0.678 | 0.452 |
| 4.589999999999777 | 1.356 | 0.678 | 0.452 |
| 4.599999999999777 | 1.357 | 0.678 | 0.452 |
| 4.609999999999777 | 1.357 | 0.679 | 0.452 |
| 4.619999999999777 | 1.358 | 0.679 | 0.453 |
| 4.629999999999777 | 1.358 | 0.679 | 0.453 |
| 4.639999999999776 | 1.359 | 0.679 | 0.453 |
| 4.649999999999776 | 1.359 | 0.679 | 0.453 |
| 4.659999999999776 | 1.359 | 0.68 | 0.453 |
| 4.669999999999776 | 1.36 | 0.68 | 0.453 |
| 4.679999999999775 | 1.36 | 0.68 | 0.453 |
| 4.689999999999775 | 1.361 | 0.68 | 0.454 |
| 4.699999999999775 | 1.361 | 0.681 | 0.454 |
| 4.709999999999775 | 1.362 | 0.681 | 0.454 |
| 4.719999999999774 | 1.362 | 0.681 | 0.454 |
| 4.729999999999774 | 1.362 | 0.681 | 0.454 |
| 4.739999999999774 | 1.363 | 0.681 | 0.454 |
| 4.749999999999774 | 1.363 | 0.682 | 0.454 |
| 4.759999999999774 | 1.364 | 0.682 | 0.455 |
| 4.769999999999774 | 1.364 | 0.682 | 0.455 |
| 4.779999999999773 | 1.365 | 0.682 | 0.455 |
| 4.789999999999773 | 1.365 | 0.682 | 0.455 |
| 4.799999999999773 | 1.365 | 0.683 | 0.455 |
| 4.809999999999773 | 1.366 | 0.683 | 0.455 |
| 4.819999999999773 | 1.366 | 0.683 | 0.455 |
| 4.829999999999773 | 1.367 | 0.683 | 0.456 |
| 4.839999999999772 | 1.367 | 0.684 | 0.456 |
| 4.849999999999772 | 1.367 | 0.684 | 0.456 |
| 4.859999999999772 | 1.368 | 0.684 | 0.456 |
| 4.869999999999772 | 1.368 | 0.684 | 0.456 |
| 4.879999999999771 | 1.369 | 0.684 | 0.456 |
| 4.889999999999771 | 1.369 | 0.685 | 0.456 |
| 4.899999999999771 | 1.369 | 0.685 | 0.456 |
| 4.90999999999977 | 1.37 | 0.685 | 0.457 |
| 4.91999999999977 | 1.37 | 0.685 | 0.457 |
| 4.92999999999977 | 1.371 | 0.685 | 0.457 |
| 4.93999999999977 | 1.371 | 0.686 | 0.457 |
| 4.94999999999977 | 1.371 | 0.686 | 0.457 |
| 4.95999999999977 | 1.372 | 0.686 | 0.457 |
| 4.96999999999977 | 1.372 | 0.686 | 0.457 |
| 4.97999999999977 | 1.373 | 0.686 | 0.458 |
| 4.98999999999977 | 1.373 | 0.687 | 0.458 |
| 4.99999999999977 | 1.373 | 0.687 | 0.458 |
| 5.009999999999768 | 1.374 | 0.687 | 0.458 |
| 5.019999999999768 | 1.374 | 0.687 | 0.458 |
| 5.029999999999768 | 1.375 | 0.687 | 0.458 |
| 5.039999999999768 | 1.375 | 0.687 | 0.458 |
| 5.049999999999767 | 1.375 | 0.688 | 0.458 |
| 5.059999999999767 | 1.376 | 0.688 | 0.459 |
| 5.069999999999767 | 1.376 | 0.688 | 0.459 |
| 5.079999999999767 | 1.376 | 0.688 | 0.459 |
| 5.089999999999767 | 1.377 | 0.688 | 0.459 |
| 5.099999999999766 | 1.377 | 0.689 | 0.459 |
| 5.109999999999766 | 1.378 | 0.689 | 0.459 |
| 5.119999999999766 | 1.378 | 0.689 | 0.459 |
| 5.129999999999766 | 1.378 | 0.689 | 0.459 |
| 5.139999999999766 | 1.379 | 0.689 | 0.46 |
| 5.149999999999765 | 1.379 | 0.69 | 0.46 |
| 5.159999999999765 | 1.379 | 0.69 | 0.46 |
| 5.169999999999765 | 1.38 | 0.69 | 0.46 |
| 5.179999999999765 | 1.38 | 0.69 | 0.46 |
| 5.189999999999764 | 1.38 | 0.69 | 0.46 |
| 5.199999999999764 | 1.381 | 0.69 | 0.46 |
| 5.209999999999764 | 1.381 | 0.691 | 0.46 |
| 5.219999999999764 | 1.382 | 0.691 | 0.461 |
| 5.229999999999764 | 1.382 | 0.691 | 0.461 |
| 5.239999999999763 | 1.382 | 0.691 | 0.461 |
| 5.249999999999763 | 1.383 | 0.691 | 0.461 |
| 5.259999999999763 | 1.383 | 0.691 | 0.461 |
| 5.269999999999763 | 1.383 | 0.692 | 0.461 |
| 5.279999999999763 | 1.384 | 0.692 | 0.461 |
| 5.289999999999762 | 1.384 | 0.692 | 0.461 |
| 5.299999999999762 | 1.384 | 0.692 | 0.461 |
| 5.309999999999762 | 1.385 | 0.692 | 0.462 |
| 5.319999999999762 | 1.385 | 0.692 | 0.462 |
| 5.329999999999762 | 1.385 | 0.693 | 0.462 |
| 5.339999999999761 | 1.386 | 0.693 | 0.462 |
| 5.349999999999761 | 1.386 | 0.693 | 0.462 |
| 5.359999999999761 | 1.386 | 0.693 | 0.462 |
| 5.369999999999761 | 1.387 | 0.693 | 0.462 |
| 5.37999999999976 | 1.387 | 0.694 | 0.462 |
| 5.38999999999976 | 1.387 | 0.694 | 0.462 |
| 5.39999999999976 | 1.388 | 0.694 | 0.463 |
| 5.40999999999976 | 1.388 | 0.694 | 0.463 |
| 5.41999999999976 | 1.388 | 0.694 | 0.463 |
| 5.42999999999976 | 1.389 | 0.694 | 0.463 |
| 5.43999999999976 | 1.389 | 0.695 | 0.463 |
| 5.44999999999976 | 1.389 | 0.695 | 0.463 |
| 5.45999999999976 | 1.39 | 0.695 | 0.463 |
| 5.46999999999976 | 1.39 | 0.695 | 0.463 |
| 5.479999999999758 | 1.39 | 0.695 | 0.463 |
| 5.489999999999758 | 1.391 | 0.695 | 0.464 |
| 5.499999999999758 | 1.391 | 0.695 | 0.464 |
| 5.509999999999758 | 1.391 | 0.696 | 0.464 |
| 5.519999999999758 | 1.392 | 0.696 | 0.464 |
| 5.529999999999758 | 1.392 | 0.696 | 0.464 |
| 5.539999999999757 | 1.392 | 0.696 | 0.464 |
| 5.549999999999757 | 1.393 | 0.696 | 0.464 |
| 5.559999999999757 | 1.393 | 0.696 | 0.464 |
| 5.569999999999757 | 1.393 | 0.697 | 0.464 |
| 5.579999999999756 | 1.393 | 0.697 | 0.464 |
| 5.589999999999756 | 1.394 | 0.697 | 0.465 |
| 5.599999999999756 | 1.394 | 0.697 | 0.465 |
| 5.609999999999756 | 1.394 | 0.697 | 0.465 |
| 5.619999999999756 | 1.395 | 0.697 | 0.465 |
| 5.629999999999756 | 1.395 | 0.698 | 0.465 |
| 5.639999999999755 | 1.395 | 0.698 | 0.465 |
| 5.649999999999755 | 1.396 | 0.698 | 0.465 |
| 5.659999999999755 | 1.396 | 0.698 | 0.465 |
| 5.669999999999755 | 1.396 | 0.698 | 0.465 |
| 5.679999999999754 | 1.397 | 0.698 | 0.466 |
| 5.689999999999754 | 1.397 | 0.698 | 0.466 |
| 5.699999999999754 | 1.397 | 0.699 | 0.466 |
| 5.709999999999754 | 1.397 | 0.699 | 0.466 |
| 5.719999999999754 | 1.398 | 0.699 | 0.466 |
| 5.729999999999753 | 1.398 | 0.699 | 0.466 |
| 5.739999999999753 | 1.398 | 0.699 | 0.466 |
| 5.749999999999753 | 1.399 | 0.699 | 0.466 |
| 5.759999999999753 | 1.399 | 0.699 | 0.466 |
| 5.769999999999753 | 1.399 | 0.7 | 0.466 |
| 5.779999999999752 | 1.399 | 0.7 | 0.466 |
| 5.789999999999752 | 1.4 | 0.7 | 0.467 |
| 5.799999999999752 | 1.4 | 0.7 | 0.467 |
| 5.809999999999752 | 1.4 | 0.7 | 0.467 |
| 5.819999999999752 | 1.401 | 0.7 | 0.467 |
| 5.829999999999751 | 1.401 | 0.7 | 0.467 |
| 5.839999999999751 | 1.401 | 0.701 | 0.467 |
| 5.849999999999751 | 1.401 | 0.701 | 0.467 |
| 5.859999999999751 | 1.402 | 0.701 | 0.467 |
| 5.86999999999975 | 1.402 | 0.701 | 0.467 |
| 5.87999999999975 | 1.402 | 0.701 | 0.467 |
| 5.88999999999975 | 1.403 | 0.701 | 0.468 |
| 5.89999999999975 | 1.403 | 0.701 | 0.468 |
| 5.90999999999975 | 1.403 | 0.702 | 0.468 |
| 5.91999999999975 | 1.403 | 0.702 | 0.468 |
| 5.92999999999975 | 1.404 | 0.702 | 0.468 |
| 5.93999999999975 | 1.404 | 0.702 | 0.468 |
| 5.949999999999748 | 1.404 | 0.702 | 0.468 |
| 5.959999999999748 | 1.405 | 0.702 | 0.468 |
| 5.969999999999748 | 1.405 | 0.702 | 0.468 |
| 5.979999999999748 | 1.405 | 0.703 | 0.468 |
| 5.989999999999747 | 1.405 | 0.703 | 0.468 |
| 5.999999999999747 | 1.406 | 0.703 | 0.469 |
| 6.009999999999747 | 1.406 | 0.703 | 0.469 |
| 6.019999999999747 | 1.406 | 0.703 | 0.469 |
| 6.029999999999747 | 1.406 | 0.703 | 0.469 |
| 6.039999999999746 | 1.407 | 0.703 | 0.469 |
| 6.049999999999746 | 1.407 | 0.703 | 0.469 |
| 6.059999999999746 | 1.407 | 0.704 | 0.469 |
| 6.069999999999746 | 1.408 | 0.704 | 0.469 |
| 6.079999999999746 | 1.408 | 0.704 | 0.469 |
| 6.089999999999745 | 1.408 | 0.704 | 0.469 |
| 6.099999999999745 | 1.408 | 0.704 | 0.469 |
| 6.109999999999745 | 1.409 | 0.704 | 0.47 |
| 6.119999999999745 | 1.409 | 0.704 | 0.47 |
| 6.129999999999745 | 1.409 | 0.705 | 0.47 |
| 6.139999999999744 | 1.409 | 0.705 | 0.47 |
| 6.149999999999744 | 1.41 | 0.705 | 0.47 |
| 6.159999999999744 | 1.41 | 0.705 | 0.47 |
| 6.169999999999744 | 1.41 | 0.705 | 0.47 |
| 6.179999999999744 | 1.41 | 0.705 | 0.47 |
| 6.189999999999744 | 1.411 | 0.705 | 0.47 |
| 6.199999999999743 | 1.411 | 0.705 | 0.47 |
| 6.209999999999743 | 1.411 | 0.706 | 0.47 |
| 6.219999999999743 | 1.411 | 0.706 | 0.47 |
| 6.229999999999743 | 1.412 | 0.706 | 0.471 |
| 6.239999999999742 | 1.412 | 0.706 | 0.471 |
| 6.249999999999742 | 1.412 | 0.706 | 0.471 |
| 6.259999999999742 | 1.412 | 0.706 | 0.471 |
| 6.269999999999742 | 1.413 | 0.706 | 0.471 |
| 6.279999999999741 | 1.413 | 0.706 | 0.471 |
| 6.289999999999741 | 1.413 | 0.707 | 0.471 |
| 6.299999999999741 | 1.413 | 0.707 | 0.471 |
| 6.309999999999741 | 1.414 | 0.707 | 0.471 |
| 6.319999999999741 | 1.414 | 0.707 | 0.471 |
| 6.329999999999741 | 1.414 | 0.707 | 0.471 |
| 6.33999999999974 | 1.414 | 0.707 | 0.471 |
| 6.34999999999974 | 1.415 | 0.707 | 0.472 |
| 6.35999999999974 | 1.415 | 0.707 | 0.472 |
| 6.36999999999974 | 1.415 | 0.708 | 0.472 |
| 6.37999999999974 | 1.415 | 0.708 | 0.472 |
| 6.38999999999974 | 1.416 | 0.708 | 0.472 |
| 6.39999999999974 | 1.416 | 0.708 | 0.472 |
| 6.409999999999738 | 1.416 | 0.708 | 0.472 |
| 6.419999999999738 | 1.416 | 0.708 | 0.472 |
| 6.429999999999738 | 1.417 | 0.708 | 0.472 |
| 6.439999999999738 | 1.417 | 0.708 | 0.472 |
| 6.449999999999738 | 1.417 | 0.708 | 0.472 |
| 6.459999999999737 | 1.417 | 0.709 | 0.472 |
| 6.469999999999737 | 1.417 | 0.709 | 0.472 |
| 6.479999999999737 | 1.418 | 0.709 | 0.473 |
| 6.489999999999737 | 1.418 | 0.709 | 0.473 |
| 6.499999999999737 | 1.418 | 0.709 | 0.473 |
| 6.509999999999736 | 1.418 | 0.709 | 0.473 |
| 6.519999999999736 | 1.419 | 0.709 | 0.473 |
| 6.529999999999736 | 1.419 | 0.709 | 0.473 |
| 6.539999999999736 | 1.419 | 0.71 | 0.473 |
| 6.549999999999736 | 1.419 | 0.71 | 0.473 |
| 6.559999999999735 | 1.42 | 0.71 | 0.473 |
| 6.569999999999735 | 1.42 | 0.71 | 0.473 |
| 6.579999999999735 | 1.42 | 0.71 | 0.473 |
| 6.589999999999735 | 1.42 | 0.71 | 0.473 |
| 6.599999999999734 | 1.42 | 0.71 | 0.473 |
| 6.609999999999734 | 1.421 | 0.71 | 0.474 |
| 6.619999999999734 | 1.421 | 0.71 | 0.474 |
| 6.629999999999734 | 1.421 | 0.711 | 0.474 |
| 6.639999999999734 | 1.421 | 0.711 | 0.474 |
| 6.649999999999734 | 1.422 | 0.711 | 0.474 |
| 6.659999999999734 | 1.422 | 0.711 | 0.474 |
| 6.669999999999733 | 1.422 | 0.711 | 0.474 |
| 6.679999999999733 | 1.422 | 0.711 | 0.474 |
| 6.689999999999733 | 1.422 | 0.711 | 0.474 |
| 6.699999999999733 | 1.423 | 0.711 | 0.474 |
| 6.709999999999732 | 1.423 | 0.711 | 0.474 |
| 6.719999999999732 | 1.423 | 0.712 | 0.474 |
| 6.729999999999732 | 1.423 | 0.712 | 0.474 |
| 6.739999999999731 | 1.424 | 0.712 | 0.475 |
| 6.749999999999731 | 1.424 | 0.712 | 0.475 |
| 6.759999999999731 | 1.424 | 0.712 | 0.475 |
| 6.769999999999731 | 1.424 | 0.712 | 0.475 |
| 6.77999999999973 | 1.424 | 0.712 | 0.475 |
| 6.78999999999973 | 1.425 | 0.712 | 0.475 |
| 6.79999999999973 | 1.425 | 0.712 | 0.475 |
| 6.80999999999973 | 1.425 | 0.712 | 0.475 |
| 6.81999999999973 | 1.425 | 0.713 | 0.475 |
| 6.82999999999973 | 1.425 | 0.713 | 0.475 |
| 6.83999999999973 | 1.426 | 0.713 | 0.475 |
| 6.84999999999973 | 1.426 | 0.713 | 0.475 |
| 6.85999999999973 | 1.426 | 0.713 | 0.475 |
| 6.86999999999973 | 1.426 | 0.713 | 0.475 |
| 6.879999999999728 | 1.426 | 0.713 | 0.475 |
| 6.889999999999728 | 1.427 | 0.713 | 0.476 |
| 6.899999999999728 | 1.427 | 0.713 | 0.476 |
| 6.909999999999728 | 1.427 | 0.714 | 0.476 |
| 6.919999999999728 | 1.427 | 0.714 | 0.476 |
| 6.929999999999727 | 1.427 | 0.714 | 0.476 |
| 6.939999999999727 | 1.428 | 0.714 | 0.476 |
| 6.949999999999727 | 1.428 | 0.714 | 0.476 |
| 6.959999999999727 | 1.428 | 0.714 | 0.476 |
| 6.969999999999727 | 1.428 | 0.714 | 0.476 |
| 6.979999999999726 | 1.428 | 0.714 | 0.476 |
| 6.989999999999726 | 1.429 | 0.714 | 0.476 |
| 6.999999999999726 | 1.429 | 0.714 | 0.476 |
| 7.009999999999726 | 1.429 | 0.715 | 0.476 |
| 7.019999999999726 | 1.429 | 0.715 | 0.476 |
| 7.029999999999725 | 1.429 | 0.715 | 0.476 |
| 7.039999999999725 | 1.43 | 0.715 | 0.477 |
| 7.049999999999725 | 1.43 | 0.715 | 0.477 |
| 7.059999999999725 | 1.43 | 0.715 | 0.477 |
| 7.069999999999724 | 1.43 | 0.715 | 0.477 |
| 7.079999999999724 | 1.43 | 0.715 | 0.477 |
| 7.089999999999724 | 1.431 | 0.715 | 0.477 |
| 7.099999999999724 | 1.431 | 0.715 | 0.477 |
| 7.109999999999724 | 1.431 | 0.716 | 0.477 |
| 7.119999999999724 | 1.431 | 0.716 | 0.477 |
| 7.129999999999724 | 1.431 | 0.716 | 0.477 |
| 7.139999999999723 | 1.432 | 0.716 | 0.477 |
| 7.149999999999723 | 1.432 | 0.716 | 0.477 |
| 7.159999999999723 | 1.432 | 0.716 | 0.477 |
| 7.169999999999723 | 1.432 | 0.716 | 0.477 |
| 7.179999999999722 | 1.432 | 0.716 | 0.477 |
| 7.189999999999722 | 1.433 | 0.716 | 0.478 |
| 7.199999999999722 | 1.433 | 0.716 | 0.478 |
| 7.209999999999721 | 1.433 | 0.716 | 0.478 |
| 7.219999999999721 | 1.433 | 0.717 | 0.478 |
| 7.229999999999721 | 1.433 | 0.717 | 0.478 |
| 7.23999999999972 | 1.434 | 0.717 | 0.478 |
| 7.24999999999972 | 1.434 | 0.717 | 0.478 |
| 7.25999999999972 | 1.434 | 0.717 | 0.478 |
| 7.26999999999972 | 1.434 | 0.717 | 0.478 |
| 7.27999999999972 | 1.434 | 0.717 | 0.478 |
| 7.28999999999972 | 1.434 | 0.717 | 0.478 |
| 7.29999999999972 | 1.435 | 0.717 | 0.478 |
| 7.30999999999972 | 1.435 | 0.717 | 0.478 |
| 7.31999999999972 | 1.435 | 0.718 | 0.478 |
| 7.329999999999719 | 1.435 | 0.718 | 0.478 |
| 7.33999999999972 | 1.435 | 0.718 | 0.478 |
| 7.349999999999719 | 1.436 | 0.718 | 0.479 |
| 7.359999999999719 | 1.436 | 0.718 | 0.479 |
| 7.369999999999718 | 1.436 | 0.718 | 0.479 |
| 7.379999999999718 | 1.436 | 0.718 | 0.479 |
| 7.389999999999718 | 1.436 | 0.718 | 0.479 |
| 7.399999999999718 | 1.436 | 0.718 | 0.479 |
| 7.409999999999717 | 1.437 | 0.718 | 0.479 |
| 7.419999999999717 | 1.437 | 0.718 | 0.479 |
| 7.429999999999717 | 1.437 | 0.719 | 0.479 |
| 7.439999999999717 | 1.437 | 0.719 | 0.479 |
| 7.449999999999716 | 1.437 | 0.719 | 0.479 |
| 7.459999999999716 | 1.438 | 0.719 | 0.479 |
| 7.469999999999716 | 1.438 | 0.719 | 0.479 |
| 7.479999999999716 | 1.438 | 0.719 | 0.479 |
| 7.489999999999715 | 1.438 | 0.719 | 0.479 |
| 7.499999999999715 | 1.438 | 0.719 | 0.479 |
| 7.509999999999715 | 1.438 | 0.719 | 0.479 |
| 7.519999999999715 | 1.439 | 0.719 | 0.48 |
| 7.529999999999715 | 1.439 | 0.719 | 0.48 |
| 7.539999999999714 | 1.439 | 0.719 | 0.48 |
| 7.549999999999714 | 1.439 | 0.72 | 0.48 |
| 7.559999999999714 | 1.439 | 0.72 | 0.48 |
| 7.569999999999714 | 1.439 | 0.72 | 0.48 |
| 7.579999999999714 | 1.44 | 0.72 | 0.48 |
| 7.589999999999714 | 1.44 | 0.72 | 0.48 |
| 7.599999999999714 | 1.44 | 0.72 | 0.48 |
| 7.609999999999713 | 1.44 | 0.72 | 0.48 |
| 7.619999999999713 | 1.44 | 0.72 | 0.48 |
| 7.629999999999713 | 1.44 | 0.72 | 0.48 |
| 7.639999999999713 | 1.441 | 0.72 | 0.48 |
| 7.649999999999712 | 1.441 | 0.72 | 0.48 |
| 7.659999999999712 | 1.441 | 0.72 | 0.48 |
| 7.669999999999712 | 1.441 | 0.721 | 0.48 |
| 7.679999999999712 | 1.441 | 0.721 | 0.48 |
| 7.689999999999712 | 1.441 | 0.721 | 0.48 |
| 7.699999999999711 | 1.442 | 0.721 | 0.481 |
| 7.709999999999711 | 1.442 | 0.721 | 0.481 |
| 7.719999999999711 | 1.442 | 0.721 | 0.481 |
| 7.729999999999711 | 1.442 | 0.721 | 0.481 |
| 7.73999999999971 | 1.442 | 0.721 | 0.481 |
| 7.74999999999971 | 1.442 | 0.721 | 0.481 |
| 7.75999999999971 | 1.443 | 0.721 | 0.481 |
| 7.76999999999971 | 1.443 | 0.721 | 0.481 |
| 7.77999999999971 | 1.443 | 0.721 | 0.481 |
| 7.78999999999971 | 1.443 | 0.722 | 0.481 |
| 7.79999999999971 | 1.443 | 0.722 | 0.481 |
| 7.80999999999971 | 1.443 | 0.722 | 0.481 |
| 7.819999999999709 | 1.444 | 0.722 | 0.481 |
| 7.829999999999709 | 1.444 | 0.722 | 0.481 |
| 7.839999999999708 | 1.444 | 0.722 | 0.481 |
| 7.849999999999708 | 1.444 | 0.722 | 0.481 |
| 7.859999999999708 | 1.444 | 0.722 | 0.481 |
| 7.869999999999708 | 1.444 | 0.722 | 0.481 |
| 7.879999999999707 | 1.445 | 0.722 | 0.482 |
| 7.889999999999707 | 1.445 | 0.722 | 0.482 |
| 7.899999999999707 | 1.445 | 0.722 | 0.482 |
| 7.909999999999707 | 1.445 | 0.723 | 0.482 |
| 7.919999999999706 | 1.445 | 0.723 | 0.482 |
| 7.929999999999706 | 1.445 | 0.723 | 0.482 |
| 7.939999999999706 | 1.446 | 0.723 | 0.482 |
| 7.949999999999706 | 1.446 | 0.723 | 0.482 |
| 7.959999999999705 | 1.446 | 0.723 | 0.482 |
| 7.969999999999705 | 1.446 | 0.723 | 0.482 |
| 7.979999999999705 | 1.446 | 0.723 | 0.482 |
| 7.989999999999705 | 1.446 | 0.723 | 0.482 |
| 7.999999999999705 | 1.446 | 0.723 | 0.482 |
| 8.009999999999703 | 1.447 | 0.723 | 0.482 |
| 8.019999999999705 | 1.447 | 0.723 | 0.482 |
| 8.029999999999704 | 1.447 | 0.723 | 0.482 |
| 8.039999999999704 | 1.447 | 0.724 | 0.482 |
| 8.049999999999704 | 1.447 | 0.724 | 0.482 |
| 8.059999999999704 | 1.447 | 0.724 | 0.482 |
| 8.069999999999704 | 1.448 | 0.724 | 0.483 |
| 8.079999999999703 | 1.448 | 0.724 | 0.483 |
| 8.089999999999703 | 1.448 | 0.724 | 0.483 |
| 8.099999999999701 | 1.448 | 0.724 | 0.483 |
| 8.109999999999703 | 1.448 | 0.724 | 0.483 |
| 8.119999999999703 | 1.448 | 0.724 | 0.483 |
| 8.129999999999702 | 1.448 | 0.724 | 0.483 |
| 8.139999999999702 | 1.449 | 0.724 | 0.483 |
| 8.1499999999997 | 1.449 | 0.724 | 0.483 |
| 8.1599999999997 | 1.449 | 0.724 | 0.483 |
| 8.1699999999997 | 1.449 | 0.725 | 0.483 |
| 8.1799999999997 | 1.449 | 0.725 | 0.483 |
| 8.1899999999997 | 1.449 | 0.725 | 0.483 |
| 8.1999999999997 | 1.449 | 0.725 | 0.483 |
| 8.2099999999997 | 1.45 | 0.725 | 0.483 |
| 8.2199999999997 | 1.45 | 0.725 | 0.483 |
| 8.2299999999997 | 1.45 | 0.725 | 0.483 |
| 8.2399999999997 | 1.45 | 0.725 | 0.483 |
| 8.2499999999997 | 1.45 | 0.725 | 0.483 |
| 8.2599999999997 | 1.45 | 0.725 | 0.483 |
| 8.2699999999997 | 1.45 | 0.725 | 0.483 |
| 8.2799999999997 | 1.451 | 0.725 | 0.484 |
| 8.289999999999697 | 1.451 | 0.725 | 0.484 |
| 8.299999999999699 | 1.451 | 0.725 | 0.484 |
| 8.309999999999699 | 1.451 | 0.726 | 0.484 |
| 8.319999999999698 | 1.451 | 0.726 | 0.484 |
| 8.329999999999698 | 1.451 | 0.726 | 0.484 |
| 8.339999999999698 | 1.451 | 0.726 | 0.484 |
| 8.349999999999698 | 1.452 | 0.726 | 0.484 |
| 8.359999999999697 | 1.452 | 0.726 | 0.484 |
| 8.369999999999697 | 1.452 | 0.726 | 0.484 |
| 8.379999999999695 | 1.452 | 0.726 | 0.484 |
| 8.389999999999697 | 1.452 | 0.726 | 0.484 |
| 8.399999999999697 | 1.452 | 0.726 | 0.484 |
| 8.409999999999696 | 1.452 | 0.726 | 0.484 |
| 8.419999999999696 | 1.453 | 0.726 | 0.484 |
| 8.429999999999694 | 1.453 | 0.726 | 0.484 |
| 8.439999999999696 | 1.453 | 0.726 | 0.484 |
| 8.449999999999696 | 1.453 | 0.727 | 0.484 |
| 8.459999999999695 | 1.453 | 0.727 | 0.484 |
| 8.469999999999695 | 1.453 | 0.727 | 0.484 |
| 8.479999999999693 | 1.453 | 0.727 | 0.484 |
| 8.489999999999695 | 1.454 | 0.727 | 0.485 |
| 8.499999999999694 | 1.454 | 0.727 | 0.485 |
| 8.509999999999694 | 1.454 | 0.727 | 0.485 |
| 8.519999999999694 | 1.454 | 0.727 | 0.485 |
| 8.529999999999694 | 1.454 | 0.727 | 0.485 |
| 8.539999999999694 | 1.454 | 0.727 | 0.485 |
| 8.549999999999693 | 1.454 | 0.727 | 0.485 |
| 8.55999999999969 | 1.455 | 0.727 | 0.485 |
| 8.56999999999969 | 1.455 | 0.727 | 0.485 |
| 8.57999999999969 | 1.455 | 0.727 | 0.485 |
| 8.58999999999969 | 1.455 | 0.727 | 0.485 |
| 8.59999999999969 | 1.455 | 0.728 | 0.485 |
| 8.60999999999969 | 1.455 | 0.728 | 0.485 |
| 8.61999999999969 | 1.455 | 0.728 | 0.485 |
| 8.62999999999969 | 1.455 | 0.728 | 0.485 |
| 8.63999999999969 | 1.456 | 0.728 | 0.485 |
| 8.64999999999969 | 1.456 | 0.728 | 0.485 |
| 8.65999999999969 | 1.456 | 0.728 | 0.485 |
| 8.66999999999969 | 1.456 | 0.728 | 0.485 |
| 8.67999999999969 | 1.456 | 0.728 | 0.485 |
| 8.68999999999969 | 1.456 | 0.728 | 0.485 |
| 8.69999999999969 | 1.456 | 0.728 | 0.485 |
| 8.70999999999969 | 1.456 | 0.728 | 0.485 |
| 8.71999999999969 | 1.457 | 0.728 | 0.486 |
| 8.72999999999969 | 1.457 | 0.728 | 0.486 |
| 8.73999999999969 | 1.457 | 0.728 | 0.486 |
| 8.74999999999969 | 1.457 | 0.729 | 0.486 |
| 8.759999999999687 | 1.457 | 0.729 | 0.486 |
| 8.769999999999689 | 1.457 | 0.729 | 0.486 |
| 8.779999999999688 | 1.457 | 0.729 | 0.486 |
| 8.789999999999688 | 1.458 | 0.729 | 0.486 |
| 8.799999999999686 | 1.458 | 0.729 | 0.486 |
| 8.809999999999688 | 1.458 | 0.729 | 0.486 |
| 8.819999999999688 | 1.458 | 0.729 | 0.486 |
| 8.829999999999687 | 1.458 | 0.729 | 0.486 |
| 8.839999999999687 | 1.458 | 0.729 | 0.486 |
| 8.849999999999685 | 1.458 | 0.729 | 0.486 |
| 8.859999999999687 | 1.458 | 0.729 | 0.486 |
| 8.869999999999687 | 1.459 | 0.729 | 0.486 |
| 8.879999999999686 | 1.459 | 0.729 | 0.486 |
| 8.889999999999686 | 1.459 | 0.729 | 0.486 |
| 8.899999999999684 | 1.459 | 0.729 | 0.486 |
| 8.909999999999686 | 1.459 | 0.73 | 0.486 |
| 8.919999999999686 | 1.459 | 0.73 | 0.486 |
| 8.929999999999685 | 1.459 | 0.73 | 0.486 |
| 8.939999999999685 | 1.459 | 0.73 | 0.486 |
| 8.949999999999685 | 1.46 | 0.73 | 0.487 |
| 8.959999999999685 | 1.46 | 0.73 | 0.487 |
| 8.969999999999684 | 1.46 | 0.73 | 0.487 |
| 8.979999999999684 | 1.46 | 0.73 | 0.487 |
| 8.989999999999682 | 1.46 | 0.73 | 0.487 |
| 8.999999999999684 | 1.46 | 0.73 | 0.487 |
| 9.009999999999684 | 1.46 | 0.73 | 0.487 |
| 9.019999999999683 | 1.46 | 0.73 | 0.487 |
| 9.029999999999683 | 1.461 | 0.73 | 0.487 |
| 9.039999999999681 | 1.461 | 0.73 | 0.487 |
| 9.049999999999683 | 1.461 | 0.73 | 0.487 |
| 9.05999999999968 | 1.461 | 0.73 | 0.487 |
| 9.06999999999968 | 1.461 | 0.73 | 0.487 |
| 9.07999999999968 | 1.461 | 0.731 | 0.487 |
| 9.08999999999968 | 1.461 | 0.731 | 0.487 |
| 9.09999999999968 | 1.461 | 0.731 | 0.487 |
| 9.10999999999968 | 1.461 | 0.731 | 0.487 |
| 9.11999999999968 | 1.462 | 0.731 | 0.487 |
| 9.12999999999968 | 1.462 | 0.731 | 0.487 |
| 9.13999999999968 | 1.462 | 0.731 | 0.487 |
| 9.14999999999968 | 1.462 | 0.731 | 0.487 |
| 9.15999999999968 | 1.462 | 0.731 | 0.487 |
| 9.16999999999968 | 1.462 | 0.731 | 0.487 |
| 9.17999999999968 | 1.462 | 0.731 | 0.487 |
| 9.18999999999968 | 1.462 | 0.731 | 0.487 |
| 9.19999999999968 | 1.463 | 0.731 | 0.488 |
| 9.20999999999968 | 1.463 | 0.731 | 0.488 |
| 9.21999999999968 | 1.463 | 0.731 | 0.488 |
| 9.229999999999677 | 1.463 | 0.731 | 0.488 |
| 9.239999999999679 | 1.463 | 0.731 | 0.488 |
| 9.249999999999678 | 1.463 | 0.732 | 0.488 |
| 9.259999999999678 | 1.463 | 0.732 | 0.488 |
| 9.269999999999678 | 1.463 | 0.732 | 0.488 |
| 9.279999999999678 | 1.463 | 0.732 | 0.488 |
| 9.289999999999678 | 1.464 | 0.732 | 0.488 |
| 9.299999999999677 | 1.464 | 0.732 | 0.488 |
| 9.309999999999677 | 1.464 | 0.732 | 0.488 |
| 9.319999999999675 | 1.464 | 0.732 | 0.488 |
| 9.329999999999677 | 1.464 | 0.732 | 0.488 |
| 9.339999999999677 | 1.464 | 0.732 | 0.488 |
| 9.349999999999676 | 1.464 | 0.732 | 0.488 |
| 9.359999999999676 | 1.464 | 0.732 | 0.488 |
| 9.369999999999674 | 1.464 | 0.732 | 0.488 |
| 9.379999999999676 | 1.465 | 0.732 | 0.488 |
| 9.389999999999675 | 1.465 | 0.732 | 0.488 |
| 9.399999999999675 | 1.465 | 0.732 | 0.488 |
| 9.409999999999675 | 1.465 | 0.732 | 0.488 |
| 9.419999999999675 | 1.465 | 0.733 | 0.488 |
| 9.429999999999675 | 1.465 | 0.733 | 0.488 |
| 9.439999999999674 | 1.465 | 0.733 | 0.488 |
| 9.449999999999674 | 1.465 | 0.733 | 0.488 |
| 9.459999999999672 | 1.465 | 0.733 | 0.488 |
| 9.469999999999674 | 1.466 | 0.733 | 0.489 |
| 9.479999999999674 | 1.466 | 0.733 | 0.489 |
| 9.489999999999673 | 1.466 | 0.733 | 0.489 |
| 9.499999999999673 | 1.466 | 0.733 | 0.489 |
| 9.509999999999671 | 1.466 | 0.733 | 0.489 |
| 9.519999999999673 | 1.466 | 0.733 | 0.489 |
| 9.529999999999673 | 1.466 | 0.733 | 0.489 |
| 9.539999999999672 | 1.466 | 0.733 | 0.489 |
| 9.549999999999672 | 1.466 | 0.733 | 0.489 |
| 9.55999999999967 | 1.467 | 0.733 | 0.489 |
| 9.56999999999967 | 1.467 | 0.733 | 0.489 |
| 9.57999999999967 | 1.467 | 0.733 | 0.489 |
| 9.58999999999967 | 1.467 | 0.733 | 0.489 |
| 9.59999999999967 | 1.467 | 0.734 | 0.489 |
| 9.60999999999967 | 1.467 | 0.734 | 0.489 |
| 9.61999999999967 | 1.467 | 0.734 | 0.489 |
| 9.62999999999967 | 1.467 | 0.734 | 0.489 |
| 9.63999999999967 | 1.467 | 0.734 | 0.489 |
| 9.64999999999967 | 1.468 | 0.734 | 0.489 |
| 9.65999999999967 | 1.468 | 0.734 | 0.489 |
| 9.66999999999967 | 1.468 | 0.734 | 0.489 |
| 9.67999999999967 | 1.468 | 0.734 | 0.489 |
| 9.689999999999667 | 1.468 | 0.734 | 0.489 |
| 9.699999999999669 | 1.468 | 0.734 | 0.489 |
| 9.709999999999669 | 1.468 | 0.734 | 0.489 |
| 9.719999999999668 | 1.468 | 0.734 | 0.489 |
| 9.729999999999668 | 1.468 | 0.734 | 0.489 |
| 9.739999999999666 | 1.468 | 0.734 | 0.489 |
| 9.749999999999668 | 1.469 | 0.734 | 0.49 |
| 9.759999999999668 | 1.469 | 0.734 | 0.49 |
| 9.769999999999667 | 1.469 | 0.734 | 0.49 |
| 9.779999999999667 | 1.469 | 0.734 | 0.49 |
| 9.789999999999665 | 1.469 | 0.735 | 0.49 |
| 9.799999999999667 | 1.469 | 0.735 | 0.49 |
| 9.809999999999667 | 1.469 | 0.735 | 0.49 |
| 9.819999999999666 | 1.469 | 0.735 | 0.49 |
| 9.829999999999666 | 1.469 | 0.735 | 0.49 |
| 9.839999999999664 | 1.47 | 0.735 | 0.49 |
| 9.849999999999666 | 1.47 | 0.735 | 0.49 |
| 9.859999999999665 | 1.47 | 0.735 | 0.49 |
| 9.869999999999665 | 1.47 | 0.735 | 0.49 |
| 9.879999999999663 | 1.47 | 0.735 | 0.49 |
| 9.889999999999665 | 1.47 | 0.735 | 0.49 |
| 9.899999999999665 | 1.47 | 0.735 | 0.49 |
| 9.909999999999664 | 1.47 | 0.735 | 0.49 |
| 9.919999999999664 | 1.47 | 0.735 | 0.49 |
| 9.929999999999662 | 1.47 | 0.735 | 0.49 |
| 9.939999999999664 | 1.471 | 0.735 | 0.49 |
| 9.949999999999664 | 1.471 | 0.735 | 0.49 |
| 9.95999999999966 | 1.471 | 0.735 | 0.49 |
| 9.96999999999966 | 1.471 | 0.735 | 0.49 |
| 9.97999999999966 | 1.471 | 0.735 | 0.49 |
| 9.98999999999966 | 1.471 | 0.736 | 0.49 |
| 9.99999999999966 | 1.471 | 0.736 | 0.49 |